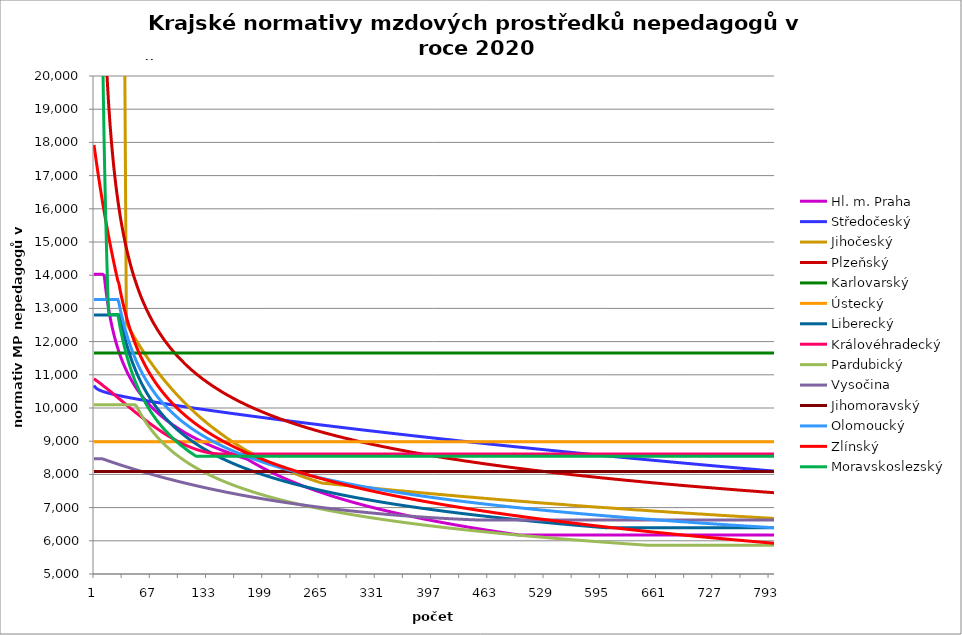
| Category | Hl. m. Praha | Středočeský | Jihočeský | Plzeňský | Karlovarský  | Ústecký   | Liberecký | Královéhradecký | Pardubický | Vysočina | Jihomoravský | Olomoucký | Zlínský | Moravskoslezský |
|---|---|---|---|---|---|---|---|---|---|---|---|---|---|---|
| 0 | 14030.172 | 10682.171 | 71798.217 | 247729.73 | 11657.998 | 8987.069 | 12801.653 | 10883.557 | 10101.406 | 8467.955 | 8087.211 | 13264.813 | 17922.62 | 232200 |
| 1 | 14030.172 | 10636.393 | 71798.217 | 123864.865 | 11657.998 | 8987.069 | 12801.653 | 10865.327 | 10101.406 | 8467.955 | 8087.211 | 13264.813 | 17735.044 | 116100 |
| 2 | 14030.172 | 10608.257 | 71798.217 | 82576.577 | 11657.998 | 8987.069 | 12801.653 | 10842.624 | 10101.406 | 8467.955 | 8087.211 | 13264.813 | 17551.353 | 77400 |
| 3 | 14030.172 | 10587.312 | 71798.217 | 61932.432 | 11657.998 | 8987.069 | 12801.653 | 10824.531 | 10101.406 | 8467.955 | 8087.211 | 13264.813 | 17371.429 | 58050 |
| 4 | 14030.172 | 10570.297 | 71798.217 | 49456.835 | 11657.998 | 8987.069 | 12801.653 | 10806.497 | 10101.406 | 8467.955 | 8087.211 | 13264.813 | 17195.155 | 46440 |
| 5 | 14030.172 | 10555.763 | 71798.217 | 41226.387 | 11657.998 | 8987.069 | 12801.653 | 10788.524 | 10101.406 | 8467.955 | 8087.211 | 13264.813 | 17022.424 | 38700 |
| 6 | 14030.172 | 10542.94 | 71798.217 | 35344.473 | 11657.998 | 8987.069 | 12801.653 | 10766.141 | 10101.406 | 8467.955 | 8087.211 | 13264.813 | 16853.128 | 33171.429 |
| 7 | 14030.172 | 10531.369 | 71798.217 | 30931.384 | 11657.998 | 8987.069 | 12801.653 | 10748.302 | 10101.406 | 8467.955 | 8087.211 | 13264.813 | 16687.166 | 29025 |
| 8 | 14030.172 | 10520.753 | 71798.217 | 27498 | 11657.998 | 8987.069 | 12801.653 | 10730.521 | 10101.406 | 8467.955 | 8087.211 | 13264.813 | 16524.442 | 25800 |
| 9 | 14030.172 | 10510.891 | 71798.217 | 24750.675 | 11657.998 | 8987.069 | 12801.653 | 10708.378 | 10101.406 | 8467.955 | 8087.211 | 13264.813 | 16364.86 | 23220 |
| 10 | 14030.172 | 10501.639 | 30465.73 | 22502.455 | 11657.998 | 8987.069 | 12801.653 | 10686.326 | 10101.406 | 8467.955 | 8087.211 | 13264.813 | 16208.331 | 21109.091 |
| 11 | 14030.172 | 10492.891 | 30465.73 | 22782.104 | 11657.998 | 8987.069 | 12801.653 | 10668.75 | 10101.406 | 8458.902 | 8087.211 | 13264.813 | 16054.768 | 19350 |
| 12 | 13992.888 | 10484.567 | 30465.73 | 21980.815 | 11657.998 | 8987.069 | 12801.653 | 10646.861 | 10101.406 | 8450.127 | 8087.211 | 13264.813 | 15904.087 | 17861.538 |
| 13 | 13757.851 | 10476.603 | 30465.73 | 21283.282 | 11657.998 | 8987.069 | 12801.653 | 10629.414 | 10101.406 | 8441.112 | 8087.211 | 13264.813 | 15756.209 | 16585.714 |
| 14 | 13545.701 | 10468.951 | 30465.73 | 20675.188 | 11657.998 | 8987.069 | 12801.653 | 10607.686 | 10101.406 | 8432.116 | 8087.211 | 13264.813 | 15611.055 | 15480 |
| 15 | 13352.792 | 10461.57 | 30465.73 | 20145.055 | 11657.998 | 8987.069 | 12801.653 | 10586.047 | 10101.406 | 8423.14 | 8087.211 | 13264.813 | 15468.551 | 14512.5 |
| 16 | 13176.251 | 10454.428 | 30465.73 | 19669.528 | 11657.998 | 8987.069 | 12801.653 | 10564.495 | 10101.406 | 8414.439 | 8087.211 | 13264.813 | 15328.626 | 13658.824 |
| 17 | 13013.779 | 10447.497 | 30465.73 | 19229.371 | 11657.998 | 8987.069 | 12801.653 | 10543.031 | 10101.406 | 8405.5 | 8087.211 | 13264.813 | 15191.209 | 12900 |
| 18 | 12863.509 | 10440.756 | 30465.73 | 18847.156 | 11657.998 | 8987.069 | 12801.653 | 10525.923 | 10101.406 | 8396.835 | 8087.211 | 13264.813 | 15056.234 | 12816.692 |
| 19 | 12723.909 | 10434.184 | 30465.73 | 18479.839 | 11657.998 | 8987.069 | 12801.653 | 10504.615 | 10101.406 | 8387.933 | 8087.211 | 13264.813 | 14923.636 | 12816.692 |
| 20 | 12593.707 | 10427.766 | 20874.667 | 18162.483 | 11657.998 | 8987.069 | 12801.653 | 10483.394 | 10101.406 | 8379.304 | 8087.211 | 13264.813 | 14793.354 | 12816.692 |
| 21 | 12471.835 | 10421.487 | 20874.667 | 17855.844 | 11657.998 | 8987.069 | 12801.653 | 10462.258 | 10101.406 | 8370.44 | 8087.211 | 13264.813 | 14665.327 | 12816.692 |
| 22 | 12357.391 | 10415.336 | 20874.667 | 17581.841 | 11657.998 | 8987.069 | 12801.653 | 10441.207 | 10101.406 | 8361.847 | 8087.211 | 13264.813 | 14539.496 | 12816.692 |
| 23 | 12249.606 | 10409.301 | 20874.667 | 17316.121 | 11657.998 | 8987.069 | 12801.653 | 10420.241 | 10101.406 | 8353.271 | 8087.211 | 13264.813 | 14415.807 | 12816.692 |
| 24 | 12147.82 | 10403.374 | 20874.667 | 17079.503 | 11657.998 | 8987.069 | 12801.653 | 10395.192 | 10101.406 | 8344.713 | 8087.211 | 13264.813 | 14294.204 | 12816.692 |
| 25 | 12051.461 | 10397.546 | 20874.667 | 16849.265 | 11657.998 | 8987.069 | 12801.653 | 10374.41 | 10101.406 | 8336.173 | 8087.211 | 13264.813 | 14174.636 | 12816.692 |
| 26 | 11960.033 | 10391.81 | 20874.667 | 16635.209 | 11657.998 | 8987.069 | 12801.653 | 10353.711 | 10101.406 | 8327.65 | 8087.211 | 13264.813 | 14057.051 | 12816.692 |
| 27 | 11873.102 | 10386.159 | 20874.667 | 16436.342 | 11657.998 | 8987.069 | 12801.653 | 10333.094 | 10101.406 | 8319.144 | 8087.211 | 13264.813 | 13941.401 | 12816.692 |
| 28 | 11790.287 | 10380.587 | 20874.667 | 16251.773 | 11657.998 | 8987.069 | 12801.653 | 10312.56 | 10101.406 | 8310.656 | 8087.211 | 13264.813 | 13827.639 | 12816.692 |
| 29 | 11711.251 | 10375.09 | 20874.667 | 16071.303 | 11657.998 | 8987.069 | 12801.653 | 10292.106 | 10101.406 | 8302.434 | 8087.211 | 13194.255 | 13773.695 | 12667.838 |
| 30 | 11635.694 | 10369.663 | 20874.667 | 15903.991 | 11657.998 | 8987.069 | 12801.729 | 10267.669 | 10101.406 | 8293.98 | 8087.211 | 13069.125 | 13637.513 | 12525.737 |
| 31 | 11563.351 | 10364.301 | 20874.667 | 15740.126 | 11657.998 | 8987.069 | 12674.904 | 10247.393 | 10101.406 | 8285.543 | 8087.211 | 12946.347 | 13507.993 | 12391.152 |
| 32 | 11493.983 | 10359 | 20874.667 | 15588.435 | 11657.998 | 8987.069 | 12554.304 | 10227.197 | 10101.406 | 8277.124 | 8087.211 | 12832.488 | 13384.591 | 12263.441 |
| 33 | 11427.377 | 10353.757 | 20874.667 | 15448.315 | 11657.998 | 8987.069 | 12439.426 | 10203.067 | 10101.406 | 8268.968 | 8087.211 | 12727.142 | 13266.824 | 12142.034 |
| 34 | 11363.341 | 10348.57 | 20874.667 | 15310.69 | 11657.998 | 8987.069 | 12329.823 | 10183.046 | 10101.406 | 8260.582 | 8087.211 | 12617.091 | 13154.26 | 12026.425 |
| 35 | 11301.701 | 10343.434 | 20874.667 | 15175.497 | 11657.998 | 8987.069 | 12225.096 | 10163.102 | 10101.406 | 8252.458 | 8087.211 | 12521.555 | 13046.513 | 11916.162 |
| 36 | 11242.299 | 10338.347 | 20874.667 | 15050.903 | 11657.998 | 8987.069 | 12124.887 | 10139.273 | 10101.406 | 8244.106 | 8087.211 | 12421.232 | 12943.237 | 11810.844 |
| 37 | 11184.993 | 10333.307 | 20874.667 | 14928.339 | 11657.998 | 8987.069 | 12028.872 | 10119.501 | 10101.406 | 8236.26 | 8087.211 | 12328.628 | 12844.119 | 11710.106 |
| 38 | 11129.652 | 10328.311 | 12552.227 | 14815.733 | 11657.998 | 8987.069 | 11936.761 | 10095.875 | 10101.406 | 8227.94 | 8087.211 | 12243.435 | 12748.875 | 11613.624 |
| 39 | 11076.156 | 10323.357 | 12505.236 | 14704.813 | 11657.998 | 8987.069 | 11848.29 | 10076.272 | 10101.406 | 8219.881 | 8087.211 | 12159.412 | 12657.249 | 11521.103 |
| 40 | 11024.399 | 10318.444 | 12458.71 | 14595.541 | 11657.998 | 8987.069 | 11763.22 | 10052.848 | 10101.406 | 8211.837 | 8087.211 | 12076.534 | 12569.008 | 11432.276 |
| 41 | 10974.278 | 10313.569 | 12412.64 | 14495.519 | 11657.998 | 8987.069 | 11681.333 | 10033.411 | 10101.406 | 8204.053 | 8087.211 | 11994.778 | 12483.939 | 11346.899 |
| 42 | 10925.703 | 10308.731 | 12367.023 | 14396.859 | 11657.998 | 8987.069 | 11602.43 | 10010.185 | 10101.406 | 8196.04 | 8087.211 | 11919.846 | 12401.848 | 11264.754 |
| 43 | 10878.588 | 10303.928 | 12321.85 | 14299.532 | 11657.998 | 8987.069 | 11526.33 | 9990.913 | 10101.406 | 8188.043 | 8087.211 | 11845.845 | 12322.558 | 11185.638 |
| 44 | 10832.856 | 10299.159 | 12277.116 | 14203.512 | 11657.998 | 8987.069 | 11452.867 | 9967.883 | 10101.406 | 8180.062 | 8087.211 | 11772.757 | 12245.904 | 11109.366 |
| 45 | 10788.434 | 10294.422 | 12232.815 | 14116.016 | 11657.998 | 8987.069 | 11381.886 | 9948.773 | 10101.406 | 8172.096 | 8087.211 | 11706.088 | 12171.738 | 11035.771 |
| 46 | 10745.255 | 10289.716 | 12188.942 | 14029.592 | 11657.998 | 8987.069 | 11313.248 | 9925.937 | 10101.406 | 8164.387 | 8087.211 | 11640.169 | 12099.92 | 10964.696 |
| 47 | 10703.256 | 10285.04 | 12145.489 | 13944.219 | 11657.998 | 8987.069 | 11246.822 | 9906.987 | 10101.406 | 8156.452 | 8087.211 | 11574.988 | 12030.323 | 10895.998 |
| 48 | 10662.381 | 10280.393 | 12102.453 | 13866.868 | 11657.998 | 8987.069 | 11182.49 | 9884.343 | 10101.406 | 8148.532 | 8087.211 | 11515.877 | 11962.829 | 10829.547 |
| 49 | 10622.575 | 10275.773 | 12059.827 | 13790.371 | 11657.998 | 8987.069 | 11120.139 | 9865.551 | 10101.406 | 8140.627 | 8087.211 | 11452.078 | 11897.328 | 10765.219 |
| 50 | 10583.788 | 10271.18 | 12017.605 | 13714.713 | 11657.998 | 8987.069 | 11059.667 | 9843.096 | 10050.07 | 8133.216 | 8087.211 | 11394.212 | 11833.719 | 10702.903 |
| 51 | 10545.973 | 10266.613 | 11975.783 | 13639.881 | 11657.998 | 8987.069 | 11000.978 | 9824.46 | 9999.816 | 8125.341 | 8087.211 | 11336.929 | 11771.907 | 10642.494 |
| 52 | 10509.086 | 10262.071 | 11934.355 | 13565.861 | 11657.998 | 8987.069 | 10943.984 | 9802.191 | 9950.984 | 8117.482 | 8087.211 | 11280.218 | 11711.805 | 10583.894 |
| 53 | 10473.085 | 10257.553 | 11893.317 | 13499.264 | 11657.998 | 8987.069 | 10888.602 | 9783.71 | 9903.505 | 8110.112 | 8087.211 | 11229.153 | 11653.33 | 10527.013 |
| 54 | 10437.934 | 10253.058 | 11852.662 | 13426.758 | 11657.998 | 8987.069 | 10834.754 | 9761.625 | 9857.315 | 8102.519 | 8087.211 | 11173.514 | 11596.407 | 10471.768 |
| 55 | 10403.595 | 10248.585 | 11812.386 | 13361.516 | 11657.998 | 8987.069 | 10782.37 | 9743.297 | 9812.354 | 8094.704 | 8087.211 | 11123.408 | 11540.963 | 10418.08 |
| 56 | 10370.034 | 10244.135 | 11772.484 | 13296.905 | 11657.998 | 8987.069 | 10731.38 | 9721.394 | 9768.568 | 8087.139 | 8087.211 | 11073.75 | 11486.932 | 10365.875 |
| 57 | 10337.219 | 10239.705 | 11732.952 | 13239.287 | 11657.998 | 8987.069 | 10681.723 | 9703.216 | 9725.903 | 8079.825 | 8087.211 | 11024.533 | 11434.251 | 10315.085 |
| 58 | 10305.121 | 10235.296 | 11693.784 | 13175.851 | 11657.998 | 8987.069 | 10633.34 | 9681.493 | 9684.311 | 8072.053 | 8087.211 | 10980.611 | 11382.861 | 10265.646 |
| 59 | 10273.71 | 10230.906 | 11654.976 | 13119.275 | 11657.998 | 8987.069 | 10586.173 | 9663.464 | 9643.744 | 8064.531 | 8087.211 | 10932.217 | 11332.707 | 10217.498 |
| 60 | 10242.961 | 10226.536 | 11616.524 | 13063.183 | 11657.998 | 8987.069 | 10540.173 | 9641.918 | 9604.161 | 8057.258 | 8087.211 | 10889.025 | 11283.738 | 10170.585 |
| 61 | 10212.847 | 10222.185 | 11578.422 | 13001.418 | 11657.998 | 8987.069 | 10495.289 | 9624.036 | 9565.521 | 8049.763 | 8087.211 | 10846.174 | 11235.903 | 10124.853 |
| 62 | 10183.345 | 10217.852 | 11540.667 | 12946.328 | 11657.998 | 8987.069 | 10451.475 | 9602.665 | 9527.784 | 8042.516 | 8087.211 | 10803.659 | 11189.158 | 10080.252 |
| 63 | 10154.432 | 10213.536 | 11503.254 | 12897.749 | 11657.998 | 8987.069 | 10408.688 | 9584.928 | 9490.914 | 8035.049 | 8087.211 | 10761.475 | 11143.458 | 10036.735 |
| 64 | 10126.086 | 10209.238 | 11466.179 | 12843.531 | 11657.998 | 8987.069 | 10366.886 | 9563.73 | 9454.878 | 8027.596 | 8087.211 | 10719.62 | 11098.762 | 9994.259 |
| 65 | 10098.288 | 10204.956 | 11429.437 | 12789.767 | 11657.998 | 8987.069 | 10326.032 | 9546.137 | 9419.643 | 8020.621 | 8087.211 | 10678.089 | 11055.032 | 9952.781 |
| 66 | 10071.017 | 10200.691 | 11393.025 | 12742.354 | 11657.998 | 8987.069 | 10286.088 | 9525.11 | 9385.179 | 8013.194 | 8087.211 | 10641.441 | 11012.231 | 9912.262 |
| 67 | 10044.256 | 10196.442 | 11356.939 | 12695.291 | 11657.998 | 8987.069 | 10247.019 | 9507.658 | 9351.455 | 8005.782 | 8087.211 | 10600.513 | 10970.324 | 9872.665 |
| 68 | 10017.986 | 10192.208 | 11321.174 | 12642.759 | 11657.998 | 8987.069 | 10208.793 | 9486.801 | 9318.446 | 7998.614 | 8087.211 | 10564.395 | 10929.279 | 9833.954 |
| 69 | 9992.192 | 10187.99 | 11285.727 | 12596.427 | 11657.998 | 8987.069 | 10171.378 | 9469.489 | 9286.124 | 7991.458 | 8087.211 | 10528.523 | 10889.063 | 9796.096 |
| 70 | 9966.858 | 10183.786 | 11250.594 | 12550.434 | 11657.998 | 8987.069 | 10134.746 | 9452.24 | 9254.466 | 7984.316 | 8087.211 | 10492.893 | 10849.647 | 9759.06 |
| 71 | 9941.968 | 10179.597 | 11215.771 | 12504.775 | 11657.998 | 8987.069 | 10098.867 | 9431.625 | 9223.448 | 7977.186 | 8087.211 | 10457.504 | 10811.003 | 9722.814 |
| 72 | 9917.508 | 10175.421 | 11181.254 | 12465.095 | 11657.998 | 8987.069 | 10063.716 | 9414.514 | 9193.046 | 7970.299 | 8087.211 | 10422.353 | 10773.105 | 9687.331 |
| 73 | 9893.464 | 10171.26 | 11147.04 | 12420.054 | 11657.998 | 8987.069 | 10029.266 | 9397.465 | 9163.241 | 7962.965 | 8087.211 | 10387.437 | 10735.927 | 9652.584 |
| 74 | 9869.824 | 10167.112 | 11113.124 | 12375.338 | 11657.998 | 8987.069 | 9995.494 | 9377.087 | 9134.012 | 7955.873 | 8087.211 | 10357.077 | 10699.444 | 9618.546 |
| 75 | 9846.574 | 10162.977 | 11079.505 | 12336.474 | 11657.998 | 8987.069 | 9962.378 | 9360.173 | 9105.34 | 7949.023 | 8087.211 | 10322.597 | 10663.633 | 9585.194 |
| 76 | 9823.703 | 10158.855 | 11046.177 | 12297.853 | 11657.998 | 8987.069 | 9929.894 | 9343.32 | 9077.206 | 7941.728 | 8087.211 | 10292.614 | 10628.473 | 9552.504 |
| 77 | 9801.199 | 10154.746 | 11013.138 | 12254.011 | 11657.998 | 8987.069 | 9898.022 | 9326.528 | 9049.592 | 7934.902 | 8087.211 | 10258.561 | 10593.942 | 9520.454 |
| 78 | 9779.052 | 10150.649 | 10980.384 | 12215.904 | 11657.998 | 8987.069 | 9866.743 | 9309.795 | 9022.483 | 7927.86 | 8087.211 | 10228.948 | 10560.02 | 9489.022 |
| 79 | 9757.251 | 10146.565 | 10947.911 | 12178.034 | 11657.998 | 8987.069 | 9836.037 | 9289.796 | 8995.862 | 7921.057 | 8087.211 | 10199.507 | 10526.688 | 9458.189 |
| 80 | 9735.785 | 10142.492 | 10915.718 | 12140.397 | 11657.998 | 8987.069 | 9805.886 | 9273.195 | 8969.714 | 7914.04 | 8087.211 | 10170.234 | 10493.928 | 9427.934 |
| 81 | 9714.646 | 10138.43 | 10883.8 | 12102.993 | 11657.998 | 8987.069 | 9776.273 | 9256.654 | 8944.024 | 7907.261 | 8087.211 | 10141.128 | 10461.722 | 9398.24 |
| 82 | 9693.824 | 10134.381 | 10852.154 | 12065.818 | 11657.998 | 8987.069 | 9747.182 | 9240.171 | 8918.779 | 7900.494 | 8087.211 | 10112.189 | 10430.054 | 9369.09 |
| 83 | 9673.31 | 10130.342 | 10820.777 | 12028.871 | 11657.998 | 8987.069 | 9718.595 | 9223.747 | 8893.964 | 7893.738 | 8087.211 | 10083.415 | 10398.906 | 9340.465 |
| 84 | 9653.096 | 10126.314 | 10789.666 | 11997.382 | 11657.998 | 8987.069 | 9690.499 | 9207.381 | 8869.568 | 7886.769 | 8087.211 | 10054.803 | 10368.265 | 9312.351 |
| 85 | 9633.173 | 10122.297 | 10758.818 | 11960.853 | 11657.998 | 8987.069 | 9662.878 | 9191.073 | 8845.578 | 7880.261 | 8087.211 | 10030.408 | 10338.115 | 9284.731 |
| 86 | 9613.534 | 10118.291 | 10728.23 | 11929.718 | 11657.998 | 8987.069 | 9635.719 | 9174.823 | 8821.982 | 7873.316 | 8087.211 | 10002.097 | 10308.442 | 9257.591 |
| 87 | 9594.171 | 10114.295 | 10697.899 | 11893.599 | 11657.998 | 8987.069 | 9609.009 | 9158.63 | 8798.768 | 7866.606 | 8087.211 | 9973.945 | 10279.233 | 9230.917 |
| 88 | 9575.076 | 10110.309 | 10667.823 | 11862.813 | 11657.998 | 8987.069 | 9582.733 | 9145.717 | 8775.927 | 7860.131 | 8087.211 | 9949.94 | 10250.474 | 9204.694 |
| 89 | 9556.244 | 10106.333 | 10637.997 | 11827.097 | 11657.998 | 8987.069 | 9556.881 | 9129.627 | 8753.447 | 7853.444 | 8087.211 | 9926.05 | 10222.153 | 9178.911 |
| 90 | 9537.666 | 10102.368 | 10608.421 | 11796.654 | 11657.998 | 8987.069 | 9531.44 | 9113.593 | 8731.319 | 7846.768 | 8087.211 | 9898.324 | 10194.258 | 9153.555 |
| 91 | 9519.337 | 10098.411 | 10579.09 | 11766.367 | 11657.998 | 8987.069 | 9506.4 | 9097.616 | 8709.533 | 7840.104 | 8087.211 | 9874.682 | 10166.778 | 9128.613 |
| 92 | 9501.251 | 10094.465 | 10550.002 | 11736.236 | 11657.998 | 8987.069 | 9481.748 | 9084.874 | 8688.08 | 7833.673 | 8087.211 | 9851.152 | 10139.701 | 9104.074 |
| 93 | 9483.401 | 10090.527 | 10521.155 | 11706.258 | 11657.998 | 8987.069 | 9457.474 | 9068.997 | 8666.951 | 7826.809 | 8087.211 | 9827.734 | 10113.016 | 9079.927 |
| 94 | 9465.781 | 10086.599 | 10492.545 | 11676.433 | 11657.998 | 8987.069 | 9433.57 | 9056.335 | 8646.137 | 7820.4 | 8087.211 | 9804.427 | 10086.714 | 9056.161 |
| 95 | 9448.386 | 10082.68 | 10464.171 | 11646.76 | 11657.998 | 8987.069 | 9410.023 | 9040.557 | 8625.631 | 7814.001 | 8087.211 | 9781.23 | 10060.784 | 9032.766 |
| 96 | 9431.211 | 10078.77 | 10436.03 | 11617.237 | 11657.998 | 8987.069 | 9386.826 | 9027.975 | 8605.423 | 7807.392 | 8087.211 | 9758.143 | 10035.217 | 9009.732 |
| 97 | 9414.25 | 10074.869 | 10408.118 | 11587.863 | 11657.998 | 8987.069 | 9363.969 | 9012.296 | 8585.507 | 7801.014 | 8087.211 | 9735.165 | 10010.003 | 8987.05 |
| 98 | 9397.498 | 10070.976 | 10380.434 | 11558.638 | 11657.998 | 8987.069 | 9341.444 | 8999.792 | 8565.876 | 7794.647 | 8087.211 | 9712.294 | 9985.134 | 8964.711 |
| 99 | 9380.95 | 10067.092 | 10352.976 | 11529.56 | 11657.998 | 8987.069 | 9319.242 | 8987.322 | 8546.521 | 7788.071 | 8087.211 | 9689.531 | 9960.602 | 8942.705 |
| 100 | 9364.603 | 10063.216 | 10325.74 | 11505.439 | 11657.998 | 8987.069 | 9297.355 | 8971.784 | 8527.436 | 7781.943 | 8087.211 | 9666.875 | 9936.397 | 8921.024 |
| 101 | 9348.45 | 10059.349 | 10298.725 | 11476.628 | 11657.998 | 8987.069 | 9275.775 | 8959.392 | 8508.615 | 7775.606 | 8087.211 | 9648.075 | 9912.513 | 8899.66 |
| 102 | 9332.488 | 10055.489 | 10271.928 | 11452.728 | 11657.998 | 8987.069 | 9254.495 | 8947.034 | 8490.052 | 7769.062 | 8087.211 | 9625.611 | 9888.94 | 8878.605 |
| 103 | 9316.712 | 10051.638 | 10245.346 | 11424.179 | 11657.998 | 8987.069 | 9233.508 | 8934.711 | 8471.739 | 7762.965 | 8087.211 | 9603.252 | 9865.673 | 8857.852 |
| 104 | 9301.118 | 10047.795 | 10218.978 | 11400.498 | 11657.998 | 8987.069 | 9212.806 | 8922.421 | 8453.671 | 7756.659 | 8087.211 | 9584.699 | 9842.703 | 8837.393 |
| 105 | 9285.703 | 10043.959 | 10192.822 | 11372.208 | 11657.998 | 8987.069 | 9192.382 | 8910.165 | 8435.843 | 7750.364 | 8087.211 | 9562.529 | 9820.024 | 8817.22 |
| 106 | 9270.462 | 10040.132 | 10166.875 | 11348.741 | 11657.998 | 8987.069 | 9172.231 | 8897.942 | 8418.248 | 7744.079 | 8087.211 | 9544.132 | 9797.628 | 8797.327 |
| 107 | 9255.392 | 10036.311 | 10141.134 | 11320.708 | 11657.998 | 8987.069 | 9152.345 | 8885.753 | 8400.882 | 7738.02 | 8087.211 | 9525.806 | 9775.511 | 8777.708 |
| 108 | 9240.489 | 10032.499 | 10115.598 | 11297.453 | 11657.998 | 8987.069 | 9132.719 | 8873.598 | 8383.739 | 7731.539 | 8087.211 | 9503.908 | 9753.664 | 8758.356 |
| 109 | 9225.749 | 10028.693 | 10090.266 | 11274.293 | 11657.998 | 8987.069 | 9113.346 | 8861.475 | 8366.814 | 7725.5 | 8087.211 | 9485.736 | 9732.083 | 8739.265 |
| 110 | 9211.169 | 10024.896 | 10065.133 | 11251.227 | 11657.998 | 8987.069 | 9094.222 | 8852.405 | 8350.102 | 7719.47 | 8087.211 | 9467.634 | 9710.761 | 8720.428 |
| 111 | 9196.746 | 10021.105 | 10040.2 | 11228.256 | 11657.998 | 8987.069 | 9075.339 | 8840.341 | 8333.598 | 7713.45 | 8087.211 | 9449.6 | 9689.692 | 8701.84 |
| 112 | 9182.477 | 10017.321 | 10015.462 | 11205.379 | 11657.998 | 8987.069 | 9056.694 | 8831.314 | 8317.298 | 7707.225 | 8087.211 | 9431.635 | 9668.872 | 8683.495 |
| 113 | 9168.358 | 10013.545 | 9990.92 | 11182.595 | 11657.998 | 8987.069 | 9038.28 | 8819.307 | 8301.198 | 7701.224 | 8087.211 | 9410.167 | 9648.294 | 8665.388 |
| 114 | 9154.386 | 10009.775 | 9966.57 | 11155.375 | 11657.998 | 8987.069 | 9020.093 | 8810.323 | 8285.293 | 7695.232 | 8087.211 | 9392.351 | 9627.953 | 8647.514 |
| 115 | 9140.559 | 10006.013 | 9942.41 | 11137.303 | 11657.998 | 8987.069 | 9002.128 | 8798.372 | 8269.579 | 7689.249 | 8087.211 | 9374.603 | 9607.845 | 8629.867 |
| 116 | 9126.873 | 10002.257 | 9918.44 | 11114.794 | 11657.998 | 8987.069 | 8984.38 | 8789.431 | 8254.051 | 7683.063 | 8087.211 | 9356.922 | 9587.964 | 8612.443 |
| 117 | 9113.326 | 9998.507 | 9894.656 | 11092.376 | 11657.998 | 8987.069 | 8966.844 | 8780.508 | 8238.707 | 7677.099 | 8087.211 | 9339.307 | 9568.307 | 8595.236 |
| 118 | 9099.915 | 9994.765 | 9871.057 | 11070.048 | 11657.998 | 8987.069 | 8949.516 | 8771.602 | 8223.541 | 7671.145 | 8087.211 | 9325.263 | 9548.867 | 8578.242 |
| 119 | 9086.638 | 9991.029 | 9847.642 | 11047.81 | 11657.998 | 8987.069 | 8932.392 | 8762.715 | 8208.552 | 7665.412 | 8087.211 | 9307.767 | 9529.641 | 8561.456 |
| 120 | 9073.491 | 9987.299 | 9824.408 | 11025.662 | 11657.998 | 8987.069 | 8915.467 | 8753.846 | 8193.733 | 7659.264 | 8087.211 | 9290.337 | 9510.625 | 8545.876 |
| 121 | 9060.473 | 9983.576 | 9801.353 | 11008.006 | 11657.998 | 8987.069 | 8898.737 | 8744.995 | 8179.084 | 7653.337 | 8087.211 | 9272.972 | 9491.813 | 8545.876 |
| 122 | 9047.581 | 9979.86 | 9778.477 | 10986.017 | 11657.998 | 8987.069 | 8882.199 | 8736.162 | 8164.599 | 7647.631 | 8087.211 | 9255.672 | 9473.203 | 8545.876 |
| 123 | 9034.812 | 9976.149 | 9755.776 | 10964.115 | 11657.998 | 8987.069 | 8865.848 | 8727.346 | 8150.276 | 7641.722 | 8087.211 | 9241.878 | 9454.79 | 8545.876 |
| 124 | 9022.165 | 9972.445 | 9733.25 | 10946.656 | 11657.998 | 8987.069 | 8849.68 | 8721.479 | 8136.111 | 7636.033 | 8087.211 | 9224.693 | 9436.57 | 8545.876 |
| 125 | 9009.637 | 9968.747 | 9710.896 | 10924.911 | 11657.998 | 8987.069 | 8833.693 | 8712.693 | 8122.102 | 7630.352 | 8087.211 | 9207.572 | 9418.54 | 8545.876 |
| 126 | 8997.226 | 9965.055 | 9688.714 | 10903.251 | 11657.998 | 8987.069 | 8817.883 | 8706.846 | 8108.245 | 7624.26 | 8087.211 | 9193.921 | 9400.696 | 8545.876 |
| 127 | 8984.93 | 9961.369 | 9666.701 | 10885.986 | 11657.998 | 8987.069 | 8802.245 | 8698.089 | 8094.538 | 7618.597 | 8087.211 | 9176.915 | 9383.034 | 8545.876 |
| 128 | 8972.747 | 9957.689 | 9644.856 | 10864.48 | 11657.998 | 8987.069 | 8786.777 | 8692.261 | 8080.977 | 7612.942 | 8087.211 | 9163.354 | 9365.55 | 8545.876 |
| 129 | 8960.675 | 9954.015 | 9623.177 | 10847.337 | 11657.998 | 8987.069 | 8771.476 | 8686.441 | 8067.56 | 7607.296 | 8087.211 | 9146.46 | 9348.243 | 8545.876 |
| 130 | 8948.711 | 9950.346 | 9601.663 | 10830.248 | 11657.998 | 8987.069 | 8756.338 | 8680.629 | 8054.283 | 7601.658 | 8087.211 | 9132.99 | 9331.107 | 8545.876 |
| 131 | 8936.855 | 9946.684 | 9580.311 | 10808.962 | 11657.998 | 8987.069 | 8741.36 | 8671.925 | 8041.146 | 7596.028 | 8087.211 | 9116.207 | 9314.141 | 8545.876 |
| 132 | 8925.103 | 9943.027 | 9559.122 | 10791.994 | 11657.998 | 8987.069 | 8726.539 | 8666.132 | 8028.144 | 7590.407 | 8087.211 | 9102.826 | 9297.34 | 8545.876 |
| 133 | 8913.455 | 9939.376 | 9538.092 | 10770.858 | 11657.998 | 8987.069 | 8711.873 | 8663.239 | 8015.275 | 7584.586 | 8087.211 | 9086.154 | 9280.703 | 8545.876 |
| 134 | 8901.909 | 9935.731 | 9517.221 | 10754.009 | 11657.998 | 8987.069 | 8697.358 | 8657.457 | 8002.538 | 7578.982 | 8087.211 | 9072.86 | 9264.225 | 8545.876 |
| 135 | 8890.462 | 9932.091 | 9496.507 | 10737.212 | 11657.998 | 8987.069 | 8682.991 | 8651.684 | 7989.928 | 7573.386 | 8087.211 | 9059.606 | 9247.904 | 8545.876 |
| 136 | 8879.113 | 9928.456 | 9475.948 | 10720.468 | 11657.998 | 8987.069 | 8668.771 | 8645.918 | 7977.446 | 7568.005 | 8087.211 | 9043.092 | 9231.738 | 8545.876 |
| 137 | 8867.861 | 9924.827 | 9455.544 | 10699.611 | 11657.998 | 8987.069 | 8654.694 | 8643.038 | 7965.087 | 7562.425 | 8087.211 | 9029.924 | 9215.724 | 8545.876 |
| 138 | 8856.704 | 9921.204 | 9435.292 | 10682.984 | 11657.998 | 8987.069 | 8640.758 | 8640.16 | 7952.85 | 7556.853 | 8087.211 | 9016.794 | 9199.858 | 8545.876 |
| 139 | 8845.64 | 9917.585 | 9415.192 | 10666.408 | 11657.998 | 8987.069 | 8626.96 | 8634.409 | 7940.732 | 7551.496 | 8087.211 | 9003.702 | 9184.139 | 8545.876 |
| 140 | 8834.668 | 9913.973 | 9395.242 | 10649.884 | 11657.998 | 8987.069 | 8613.298 | 8631.537 | 7928.732 | 7545.94 | 8087.211 | 8990.649 | 9168.563 | 8545.876 |
| 141 | 8823.786 | 9910.365 | 9375.44 | 10633.411 | 11657.998 | 8987.069 | 8599.77 | 8628.666 | 7916.848 | 7540.598 | 8087.211 | 8974.385 | 9153.129 | 8545.876 |
| 142 | 8812.994 | 9906.763 | 9355.786 | 10616.988 | 11657.998 | 8987.069 | 8586.373 | 8625.798 | 7905.077 | 7535.263 | 8087.211 | 8961.416 | 9137.834 | 8545.876 |
| 143 | 8802.288 | 9903.165 | 9336.278 | 10600.617 | 11657.998 | 8987.069 | 8573.104 | 8622.931 | 7893.418 | 7529.732 | 8087.211 | 8948.485 | 9122.676 | 8545.876 |
| 144 | 8791.669 | 9899.573 | 9316.914 | 10584.296 | 11657.998 | 8987.069 | 8559.962 | 8620.066 | 7881.868 | 7524.412 | 8087.211 | 8935.591 | 9107.652 | 8545.876 |
| 145 | 8781.135 | 9895.986 | 9297.694 | 10568.025 | 11657.998 | 8987.069 | 8546.945 | 8617.204 | 7870.427 | 7519.101 | 8087.211 | 8922.734 | 9092.76 | 8545.876 |
| 146 | 8770.684 | 9892.404 | 9278.615 | 10551.804 | 11657.998 | 8987.069 | 8534.05 | 8617.204 | 7859.091 | 7513.797 | 8087.211 | 8909.914 | 9077.998 | 8545.876 |
| 147 | 8760.315 | 9888.827 | 9259.678 | 10535.632 | 11657.998 | 8987.069 | 8521.276 | 8617.204 | 7847.86 | 7508.5 | 8087.211 | 8897.131 | 9063.364 | 8545.876 |
| 148 | 8750.027 | 9885.255 | 9240.88 | 10519.51 | 11657.998 | 8987.069 | 8508.62 | 8617.204 | 7836.731 | 7503.211 | 8087.211 | 8884.384 | 9048.856 | 8545.876 |
| 149 | 8739.819 | 9881.688 | 9222.22 | 10503.438 | 11657.998 | 8987.069 | 8496.081 | 8617.204 | 7825.703 | 7497.929 | 8087.211 | 8871.674 | 9034.471 | 8545.876 |
| 150 | 8729.689 | 9878.126 | 9203.698 | 10487.414 | 11657.998 | 8987.069 | 8483.656 | 8617.204 | 7814.775 | 7492.654 | 8087.211 | 8859 | 9020.208 | 8545.876 |
| 151 | 8719.636 | 9874.569 | 9185.311 | 10471.439 | 11657.998 | 8987.069 | 8471.343 | 8617.204 | 7803.944 | 7487.387 | 8087.211 | 8846.362 | 9006.065 | 8545.876 |
| 152 | 8709.66 | 9871.016 | 9167.06 | 10455.513 | 11657.998 | 8987.069 | 8459.142 | 8617.204 | 7793.209 | 7482.128 | 8087.211 | 8836.908 | 8992.039 | 8545.876 |
| 153 | 8699.758 | 9867.469 | 9148.941 | 10443.6 | 11657.998 | 8987.069 | 8447.05 | 8617.204 | 7782.569 | 7476.876 | 8087.211 | 8824.333 | 8978.13 | 8545.876 |
| 154 | 8689.93 | 9863.926 | 9130.956 | 10427.759 | 11657.998 | 8987.069 | 8435.064 | 8617.204 | 7772.022 | 7471.833 | 8087.211 | 8811.794 | 8964.335 | 8545.876 |
| 155 | 8680.175 | 9860.387 | 9113.101 | 10411.965 | 11657.998 | 8987.069 | 8423.185 | 8617.204 | 7761.567 | 7466.595 | 8087.211 | 8799.291 | 8950.653 | 8545.876 |
| 156 | 8670.492 | 9856.854 | 9095.377 | 10396.219 | 11657.998 | 8987.069 | 8411.41 | 8617.204 | 7751.202 | 7461.364 | 8087.211 | 8786.823 | 8937.081 | 8545.876 |
| 157 | 8660.879 | 9853.325 | 9077.782 | 10384.441 | 11657.998 | 8987.069 | 8399.737 | 8617.204 | 7740.925 | 7456.342 | 8087.211 | 8777.495 | 8923.618 | 8545.876 |
| 158 | 8651.336 | 9849.8 | 9060.314 | 10368.778 | 11657.998 | 8987.069 | 8388.164 | 8617.204 | 7730.736 | 7451.326 | 8087.211 | 8765.088 | 8910.263 | 8545.876 |
| 159 | 8641.862 | 9846.281 | 9042.974 | 10353.163 | 11657.998 | 8987.069 | 8376.691 | 8617.204 | 7720.634 | 7446.117 | 8087.211 | 8752.717 | 8897.013 | 8545.876 |
| 160 | 8632.455 | 9842.765 | 9025.759 | 10341.482 | 11657.998 | 8987.069 | 8365.316 | 8617.204 | 7710.615 | 7441.116 | 8087.211 | 8743.461 | 8883.868 | 8545.876 |
| 161 | 8623.115 | 9839.255 | 9008.669 | 10325.948 | 11657.998 | 8987.069 | 8354.036 | 8617.204 | 7700.681 | 7436.32 | 8087.211 | 8731.151 | 8870.825 | 8545.876 |
| 162 | 8613.841 | 9835.748 | 8991.703 | 10310.461 | 11657.998 | 8987.069 | 8342.852 | 8617.204 | 7690.829 | 7431.132 | 8087.211 | 8718.875 | 8857.884 | 8545.876 |
| 163 | 8604.631 | 9832.246 | 8974.859 | 10298.876 | 11657.998 | 8987.069 | 8331.761 | 8617.204 | 7681.057 | 7426.15 | 8087.211 | 8709.691 | 8845.042 | 8545.876 |
| 164 | 8595.486 | 9828.749 | 8958.137 | 10283.47 | 11657.998 | 8987.069 | 8320.761 | 8617.204 | 7671.366 | 7421.175 | 8087.211 | 8697.475 | 8832.298 | 8545.876 |
| 165 | 8586.404 | 9825.256 | 8941.536 | 10271.946 | 11657.998 | 8987.069 | 8309.852 | 8617.204 | 7661.753 | 7416.207 | 8087.211 | 8685.294 | 8819.651 | 8545.876 |
| 166 | 8577.384 | 9821.767 | 8925.055 | 10256.621 | 11657.998 | 8987.069 | 8299.033 | 8617.204 | 7652.218 | 7411.245 | 8087.211 | 8676.18 | 8807.1 | 8545.876 |
| 167 | 8568.425 | 9818.283 | 8908.692 | 10245.156 | 11657.998 | 8987.069 | 8288.301 | 8617.204 | 7642.759 | 7406.29 | 8087.211 | 8664.059 | 8794.642 | 8545.876 |
| 168 | 8559.527 | 9814.803 | 8892.446 | 10229.911 | 11657.998 | 8987.069 | 8277.656 | 8617.204 | 7633.376 | 7401.342 | 8087.211 | 8654.99 | 8782.277 | 8545.876 |
| 169 | 8550.689 | 9811.327 | 8876.318 | 10218.506 | 11657.998 | 8987.069 | 8267.097 | 8617.204 | 7624.067 | 7396.597 | 8087.211 | 8642.927 | 8770.004 | 8545.876 |
| 170 | 8541.91 | 9807.855 | 8860.305 | 10203.34 | 11657.998 | 8987.069 | 8256.621 | 8617.204 | 7614.83 | 7391.859 | 8087.211 | 8633.902 | 8757.82 | 8545.876 |
| 171 | 8533.188 | 9804.388 | 8844.407 | 10191.994 | 11657.998 | 8987.069 | 8246.229 | 8617.204 | 7605.666 | 7386.93 | 8087.211 | 8621.898 | 8745.726 | 8545.876 |
| 172 | 8524.525 | 9800.925 | 8828.623 | 10176.906 | 11657.998 | 8987.069 | 8235.918 | 8617.204 | 7596.574 | 7382.007 | 8087.211 | 8612.917 | 8733.719 | 8545.876 |
| 173 | 8515.917 | 9797.466 | 8812.952 | 10165.619 | 11657.998 | 8987.069 | 8225.688 | 8617.204 | 7587.551 | 7377.288 | 8087.211 | 8603.954 | 8721.798 | 8545.876 |
| 174 | 8507.366 | 9794.011 | 8797.393 | 10154.357 | 11657.998 | 8987.069 | 8215.537 | 8617.204 | 7578.597 | 7372.574 | 8087.211 | 8592.033 | 8709.963 | 8545.876 |
| 175 | 8498.87 | 9790.56 | 8781.946 | 10139.381 | 11657.998 | 8987.069 | 8205.465 | 8617.204 | 7569.712 | 7367.867 | 8087.211 | 8583.114 | 8698.211 | 8545.876 |
| 176 | 8490.429 | 9787.113 | 8766.608 | 10128.177 | 11657.998 | 8987.069 | 8195.47 | 8617.204 | 7560.893 | 7362.969 | 8087.211 | 8571.251 | 8686.543 | 8545.876 |
| 177 | 8482.041 | 9783.67 | 8751.381 | 10116.998 | 11657.998 | 8987.069 | 8185.552 | 8617.204 | 7552.141 | 7358.274 | 8087.211 | 8562.375 | 8674.956 | 8545.876 |
| 178 | 8473.707 | 9780.232 | 8736.261 | 10102.131 | 11657.998 | 8987.069 | 8175.708 | 8617.204 | 7543.455 | 7353.585 | 8087.211 | 8553.517 | 8663.45 | 8545.876 |
| 179 | 8465.424 | 9776.797 | 8721.25 | 10091.009 | 11657.998 | 8987.069 | 8165.939 | 8617.204 | 7534.833 | 7348.901 | 8087.211 | 8541.736 | 8652.024 | 8545.876 |
| 180 | 8456.47 | 9773.367 | 8706.345 | 10079.912 | 11657.998 | 8987.069 | 8156.242 | 8617.204 | 7526.275 | 7344.224 | 8087.211 | 8532.921 | 8640.676 | 8545.876 |
| 181 | 8440.899 | 9769.94 | 8691.547 | 10068.839 | 11657.998 | 8987.069 | 8146.618 | 8617.204 | 7517.779 | 7339.553 | 8087.211 | 8524.124 | 8629.406 | 8545.876 |
| 182 | 8425.46 | 9766.517 | 8676.853 | 10054.113 | 11657.998 | 8987.069 | 8137.065 | 8617.204 | 7509.346 | 7334.887 | 8087.211 | 8512.423 | 8618.212 | 8545.876 |
| 183 | 8410.151 | 9763.098 | 8662.265 | 10043.097 | 11657.998 | 8987.069 | 8127.583 | 8617.204 | 7500.973 | 7330.422 | 8087.211 | 8503.668 | 8607.094 | 8545.876 |
| 184 | 8394.971 | 9759.683 | 8647.779 | 10032.105 | 11657.998 | 8987.069 | 8118.169 | 8617.204 | 7492.661 | 7325.768 | 8087.211 | 8494.932 | 8596.05 | 8545.876 |
| 185 | 8379.917 | 9756.272 | 8633.397 | 10021.137 | 11657.998 | 8987.069 | 8108.824 | 8617.204 | 7484.409 | 7321.12 | 8087.211 | 8486.213 | 8585.08 | 8545.876 |
| 186 | 8364.987 | 9752.865 | 8619.117 | 10010.193 | 11657.998 | 8987.069 | 8099.547 | 8617.204 | 7476.215 | 7316.671 | 8087.211 | 8477.512 | 8574.183 | 8545.876 |
| 187 | 8350.18 | 9749.462 | 8604.938 | 9995.638 | 11657.998 | 8987.069 | 8090.336 | 8617.204 | 7468.08 | 7312.228 | 8087.211 | 8465.939 | 8563.357 | 8545.876 |
| 188 | 8335.495 | 9746.062 | 8590.859 | 9984.749 | 11657.998 | 8987.069 | 8081.191 | 8617.204 | 7460.001 | 7307.597 | 8087.211 | 8457.279 | 8552.602 | 8545.876 |
| 189 | 8320.928 | 9742.666 | 8576.881 | 9973.885 | 11657.998 | 8987.069 | 8072.111 | 8617.204 | 7451.98 | 7302.972 | 8087.211 | 8448.638 | 8541.918 | 8545.876 |
| 190 | 8306.479 | 9739.274 | 8563.001 | 9963.043 | 11657.998 | 8987.069 | 8063.095 | 8617.204 | 7444.014 | 7298.738 | 8087.211 | 8440.014 | 8531.302 | 8545.876 |
| 191 | 8292.146 | 9735.886 | 8549.22 | 9952.226 | 11657.998 | 8987.069 | 8054.142 | 8617.204 | 7436.103 | 7294.124 | 8087.211 | 8431.407 | 8520.754 | 8545.876 |
| 192 | 8277.928 | 9732.501 | 8535.536 | 9941.432 | 11657.998 | 8987.069 | 8045.252 | 8617.204 | 7428.247 | 7289.9 | 8087.211 | 8422.818 | 8510.274 | 8545.876 |
| 193 | 8263.822 | 9729.121 | 8521.949 | 9930.661 | 11657.998 | 8987.069 | 8036.423 | 8617.204 | 7420.444 | 7285.297 | 8087.211 | 8414.247 | 8499.861 | 8545.876 |
| 194 | 8249.828 | 9725.743 | 8508.458 | 9919.913 | 11657.998 | 8987.069 | 8027.656 | 8617.204 | 7412.695 | 7280.892 | 8087.211 | 8405.693 | 8489.513 | 8545.876 |
| 195 | 8235.943 | 9722.37 | 8495.063 | 9909.189 | 11657.998 | 8987.069 | 8018.948 | 8617.204 | 7404.998 | 7276.301 | 8087.211 | 8394.315 | 8479.23 | 8545.876 |
| 196 | 8222.166 | 9719 | 8481.762 | 9898.488 | 11657.998 | 8987.069 | 8010.3 | 8617.204 | 7397.353 | 7272.097 | 8087.211 | 8385.801 | 8469.011 | 8545.876 |
| 197 | 8208.496 | 9715.634 | 8468.555 | 9887.81 | 11657.998 | 8987.069 | 8001.711 | 8617.204 | 7389.759 | 7267.708 | 8087.211 | 8377.305 | 8458.856 | 8545.876 |
| 198 | 8194.931 | 9712.271 | 8455.441 | 9877.155 | 11657.998 | 8987.069 | 7993.179 | 8617.204 | 7382.216 | 7263.514 | 8087.211 | 8368.826 | 8448.763 | 8545.876 |
| 199 | 8181.47 | 9708.912 | 8442.421 | 9866.523 | 11657.998 | 8987.069 | 7984.705 | 8617.204 | 7374.722 | 7259.135 | 8087.211 | 8360.364 | 8438.732 | 8545.876 |
| 200 | 8168.111 | 9705.557 | 8429.492 | 9855.914 | 11657.998 | 8987.069 | 7976.287 | 8617.204 | 7367.278 | 7254.761 | 8087.211 | 8351.919 | 8428.762 | 8545.876 |
| 201 | 8154.854 | 9702.205 | 8416.654 | 9845.328 | 11657.998 | 8987.069 | 7967.925 | 8617.204 | 7359.883 | 7250.583 | 8087.211 | 8343.491 | 8418.853 | 8545.876 |
| 202 | 8141.696 | 9698.857 | 8403.907 | 9834.764 | 11657.998 | 8987.069 | 7959.619 | 8617.204 | 7352.535 | 7246.219 | 8087.211 | 8335.081 | 8409.003 | 8545.876 |
| 203 | 8128.637 | 9695.512 | 8391.251 | 9824.223 | 11657.998 | 8987.069 | 7951.366 | 8617.204 | 7345.236 | 7242.05 | 8087.211 | 8326.687 | 8399.213 | 8545.876 |
| 204 | 8115.675 | 9692.171 | 8378.683 | 9813.704 | 11657.998 | 8987.069 | 7943.168 | 8617.204 | 7337.983 | 7237.697 | 8087.211 | 8318.31 | 8389.481 | 8545.876 |
| 205 | 8102.808 | 9688.833 | 8366.204 | 9803.209 | 11657.998 | 8987.069 | 7935.023 | 8617.204 | 7330.777 | 7233.349 | 8087.211 | 8312.735 | 8379.806 | 8545.876 |
| 206 | 8090.037 | 9685.499 | 8353.814 | 9792.735 | 11657.998 | 8987.069 | 7926.931 | 8617.204 | 7323.617 | 7229.384 | 8087.211 | 8304.386 | 8370.189 | 8545.876 |
| 207 | 8077.358 | 9682.168 | 8341.511 | 9782.284 | 11657.998 | 8987.069 | 7918.89 | 8617.204 | 7316.502 | 7225.046 | 8087.211 | 8296.054 | 8360.627 | 8545.876 |
| 208 | 8064.772 | 9678.841 | 8329.295 | 9771.855 | 11657.998 | 8987.069 | 7910.902 | 8617.204 | 7309.432 | 7221.089 | 8087.211 | 8287.738 | 8351.122 | 8545.876 |
| 209 | 8052.277 | 9675.517 | 8317.165 | 9764.915 | 11657.998 | 8987.069 | 7902.963 | 8617.204 | 7302.407 | 7216.761 | 8087.211 | 8279.439 | 8341.672 | 8545.876 |
| 210 | 8039.872 | 9672.196 | 8305.121 | 9754.523 | 11657.998 | 8987.069 | 7895.075 | 8617.204 | 7295.425 | 7212.814 | 8087.211 | 8271.157 | 8332.276 | 8545.876 |
| 211 | 8027.555 | 9668.879 | 8293.162 | 9744.153 | 11657.998 | 8987.069 | 7887.237 | 8617.204 | 7288.487 | 7208.496 | 8087.211 | 8262.891 | 8322.934 | 8545.876 |
| 212 | 8015.327 | 9665.565 | 8281.287 | 9733.805 | 11657.998 | 8987.069 | 7879.448 | 8617.204 | 7281.591 | 7204.558 | 8087.211 | 8254.642 | 8313.645 | 8545.876 |
| 213 | 8003.184 | 9662.255 | 8269.496 | 9723.479 | 11657.998 | 8987.069 | 7871.707 | 8617.204 | 7274.738 | 7200.437 | 8087.211 | 8249.152 | 8304.409 | 8545.876 |
| 214 | 7991.128 | 9658.948 | 8257.789 | 9716.608 | 11657.998 | 8987.069 | 7864.014 | 8617.204 | 7267.927 | 7196.32 | 8087.211 | 8240.93 | 8295.225 | 8545.876 |
| 215 | 7979.155 | 9655.644 | 8246.165 | 9706.318 | 11657.998 | 8987.069 | 7856.369 | 8617.204 | 7261.157 | 7192.209 | 8087.211 | 8232.725 | 8286.093 | 8545.876 |
| 216 | 7967.266 | 9652.344 | 8234.623 | 9696.051 | 11657.998 | 8987.069 | 7848.771 | 8617.204 | 7254.428 | 7188.288 | 8087.211 | 8224.536 | 8277.012 | 8545.876 |
| 217 | 7955.46 | 9649.047 | 8223.162 | 9685.805 | 11657.998 | 8987.069 | 7841.219 | 8617.204 | 7247.74 | 7184.186 | 8087.211 | 8216.363 | 8267.981 | 8545.876 |
| 218 | 7943.734 | 9645.753 | 8211.783 | 9675.581 | 11657.998 | 8987.069 | 7833.712 | 8617.204 | 7241.092 | 7180.274 | 8087.211 | 8210.924 | 8259 | 8545.876 |
| 219 | 7932.089 | 9642.463 | 8200.484 | 9668.776 | 11657.998 | 8987.069 | 7826.251 | 8617.204 | 7234.483 | 7176.181 | 8087.211 | 8202.778 | 8250.068 | 8545.876 |
| 220 | 7920.524 | 9639.175 | 8189.266 | 9658.588 | 11657.998 | 8987.069 | 7818.835 | 8617.204 | 7227.914 | 7172.278 | 8087.211 | 8194.648 | 8241.185 | 8545.876 |
| 221 | 7909.037 | 9635.892 | 8178.126 | 9648.421 | 11657.998 | 8987.069 | 7811.464 | 8617.204 | 7221.383 | 7168.194 | 8087.211 | 8186.535 | 8232.35 | 8545.876 |
| 222 | 7897.627 | 9632.611 | 8167.066 | 9641.655 | 11657.998 | 8987.069 | 7804.136 | 8617.204 | 7214.891 | 7164.485 | 8087.211 | 8181.135 | 8223.563 | 8545.876 |
| 223 | 7886.294 | 9629.333 | 8156.085 | 9631.524 | 11657.998 | 8987.069 | 7796.852 | 8617.204 | 7208.437 | 7160.595 | 8087.211 | 8173.048 | 8214.824 | 8545.876 |
| 224 | 7875.036 | 9626.059 | 8145.181 | 9621.414 | 11657.998 | 8987.069 | 7789.61 | 8617.204 | 7202.02 | 7156.524 | 8087.211 | 8164.977 | 8206.131 | 8545.876 |
| 225 | 7863.854 | 9622.788 | 8134.355 | 9614.685 | 11657.998 | 8987.069 | 7782.411 | 8617.204 | 7195.641 | 7152.827 | 8087.211 | 8156.922 | 8197.485 | 8545.876 |
| 226 | 7852.745 | 9619.52 | 8123.606 | 9604.611 | 11657.998 | 8987.069 | 7775.254 | 8617.204 | 7189.298 | 7148.765 | 8087.211 | 8151.561 | 8188.884 | 8545.876 |
| 227 | 7841.709 | 9616.256 | 8112.933 | 9594.557 | 11657.998 | 8987.069 | 7768.139 | 8617.204 | 7182.991 | 7145.076 | 8087.211 | 8143.533 | 8180.329 | 8545.876 |
| 228 | 7830.746 | 9612.994 | 8102.337 | 9587.866 | 11657.998 | 8987.069 | 7761.065 | 8617.204 | 7176.721 | 7141.207 | 8087.211 | 8135.52 | 8171.818 | 8545.876 |
| 229 | 7819.854 | 9609.736 | 8091.816 | 9577.847 | 11657.998 | 8987.069 | 7754.031 | 8617.204 | 7170.486 | 7137.342 | 8087.211 | 8130.187 | 8163.352 | 8545.876 |
| 230 | 7809.032 | 9606.48 | 8081.37 | 9567.85 | 11657.998 | 8987.069 | 7747.038 | 8617.204 | 7164.287 | 7133.665 | 8087.211 | 8122.2 | 8154.93 | 8545.876 |
| 231 | 7798.28 | 9603.228 | 8070.998 | 9561.196 | 11657.998 | 8987.069 | 7740.084 | 8617.204 | 7158.122 | 7129.624 | 8087.211 | 8116.885 | 8146.552 | 8545.876 |
| 232 | 7787.598 | 9599.979 | 8060.701 | 9551.233 | 11657.998 | 8987.069 | 7733.17 | 8617.204 | 7151.992 | 7125.955 | 8087.211 | 8108.924 | 8138.216 | 8545.876 |
| 233 | 7776.983 | 9596.733 | 8050.477 | 9544.603 | 11657.998 | 8987.069 | 7726.296 | 8617.204 | 7145.895 | 7122.29 | 8087.211 | 8100.98 | 8129.923 | 8545.876 |
| 234 | 7766.436 | 9593.491 | 8040.326 | 9534.674 | 11657.998 | 8987.069 | 7719.459 | 8617.204 | 7139.833 | 7118.445 | 8087.211 | 8095.692 | 8121.673 | 8545.876 |
| 235 | 7755.955 | 9590.251 | 8030.248 | 9524.766 | 11657.998 | 8987.069 | 7712.661 | 8617.204 | 7133.804 | 7114.788 | 8087.211 | 8087.773 | 8113.464 | 8545.876 |
| 236 | 7745.54 | 9587.014 | 8020.242 | 9518.172 | 11657.998 | 8987.069 | 7705.901 | 8617.204 | 7127.809 | 7111.134 | 8087.211 | 8082.502 | 8105.297 | 8545.876 |
| 237 | 7735.19 | 9583.781 | 8010.308 | 9508.299 | 11657.998 | 8987.069 | 7699.178 | 8617.204 | 7121.846 | 7107.301 | 8087.211 | 8074.609 | 8097.17 | 8545.876 |
| 238 | 7724.905 | 9580.55 | 8000.446 | 9501.728 | 11657.998 | 8987.069 | 7692.492 | 8617.204 | 7115.915 | 7103.655 | 8087.211 | 8066.732 | 8089.084 | 8545.876 |
| 239 | 7714.684 | 9577.323 | 7990.654 | 9491.888 | 11657.998 | 8987.069 | 7685.843 | 8617.204 | 7110.017 | 7100.195 | 8087.211 | 8061.488 | 8081.039 | 8545.876 |
| 240 | 7704.525 | 9574.098 | 7980.933 | 9485.34 | 11657.998 | 8987.069 | 7679.23 | 8617.204 | 7104.15 | 7096.374 | 8087.211 | 8053.636 | 8073.033 | 8545.876 |
| 241 | 7694.429 | 9570.877 | 7971.282 | 9475.534 | 11657.998 | 8987.069 | 7672.654 | 8617.204 | 7098.315 | 7092.739 | 8087.211 | 8048.41 | 8065.066 | 8545.876 |
| 242 | 7684.395 | 9567.658 | 7961.701 | 9469.008 | 11657.998 | 8987.069 | 7666.112 | 8617.204 | 7092.511 | 7089.289 | 8087.211 | 8040.583 | 8057.139 | 8545.876 |
| 243 | 7674.421 | 9564.443 | 7952.188 | 9459.236 | 11657.998 | 8987.069 | 7659.607 | 8617.204 | 7086.738 | 7085.662 | 8087.211 | 8035.374 | 8049.25 | 8545.876 |
| 244 | 7664.508 | 9561.23 | 7942.745 | 9452.733 | 11657.998 | 8987.069 | 7653.136 | 8617.204 | 7080.996 | 7082.038 | 8087.211 | 8027.573 | 8041.4 | 8545.876 |
| 245 | 7654.655 | 9558.021 | 7933.37 | 9442.995 | 11657.998 | 8987.069 | 7646.699 | 8617.204 | 7075.284 | 7078.417 | 8087.211 | 8022.38 | 8033.587 | 8545.876 |
| 246 | 7644.86 | 9554.814 | 7924.063 | 9436.513 | 11657.998 | 8987.069 | 7640.297 | 8617.204 | 7069.602 | 7074.981 | 8087.211 | 8014.604 | 8025.812 | 8545.876 |
| 247 | 7635.124 | 9551.61 | 7914.824 | 9426.808 | 11657.998 | 8987.069 | 7633.929 | 8617.204 | 7063.949 | 7071.188 | 8087.211 | 8009.428 | 8018.074 | 8545.876 |
| 248 | 7625.446 | 9548.41 | 7905.652 | 9420.349 | 11657.998 | 8987.069 | 7627.594 | 8617.204 | 7058.326 | 7067.759 | 8087.211 | 8001.677 | 8010.373 | 8545.876 |
| 249 | 7615.825 | 9545.212 | 7896.546 | 9413.899 | 11657.998 | 8987.069 | 7621.292 | 8617.204 | 7052.733 | 7064.333 | 8087.211 | 7996.518 | 8002.709 | 8545.876 |
| 250 | 7606.261 | 9542.017 | 7887.508 | 9404.241 | 11657.998 | 8987.069 | 7615.024 | 8617.204 | 7047.168 | 7060.911 | 8087.211 | 7988.792 | 7995.081 | 8545.876 |
| 251 | 7596.753 | 9538.825 | 7878.535 | 9397.813 | 11657.998 | 8987.069 | 7608.788 | 8617.204 | 7041.631 | 7057.492 | 8087.211 | 7983.65 | 7987.488 | 8545.876 |
| 252 | 7587.3 | 9535.636 | 7869.627 | 9388.187 | 11657.998 | 8987.069 | 7602.584 | 8617.204 | 7036.123 | 7053.897 | 8087.211 | 7978.514 | 7979.931 | 8545.876 |
| 253 | 7577.902 | 9532.45 | 7860.786 | 9381.781 | 11657.998 | 8987.069 | 7596.412 | 8617.204 | 7030.643 | 7050.485 | 8087.211 | 7970.823 | 7972.409 | 8545.876 |
| 254 | 7568.558 | 9529.267 | 7852.009 | 9375.384 | 11657.998 | 8987.069 | 7590.272 | 8617.204 | 7025.19 | 7047.076 | 8087.211 | 7965.703 | 7964.922 | 8545.876 |
| 255 | 7559.268 | 9526.086 | 7843.296 | 9365.804 | 11657.998 | 8987.069 | 7584.164 | 8617.204 | 7019.766 | 7043.671 | 8087.211 | 7958.037 | 7957.47 | 8545.876 |
| 256 | 7550.031 | 9522.909 | 7834.648 | 9359.428 | 11657.998 | 8987.069 | 7578.086 | 8617.204 | 7014.368 | 7040.268 | 8087.211 | 7952.934 | 7950.052 | 8545.876 |
| 257 | 7540.846 | 9519.734 | 7826.063 | 9349.881 | 11657.998 | 8987.069 | 7572.04 | 8617.204 | 7008.997 | 7036.691 | 8087.211 | 7947.837 | 7942.668 | 8545.876 |
| 258 | 7531.714 | 9516.562 | 7817.543 | 9343.527 | 11657.998 | 8987.069 | 7566.023 | 8617.204 | 7003.654 | 7033.474 | 8087.211 | 7940.205 | 7935.317 | 8545.876 |
| 259 | 7522.634 | 9513.393 | 7809.085 | 9337.182 | 11657.998 | 8987.069 | 7560.037 | 8617.204 | 6998.336 | 7030.081 | 8087.211 | 7935.125 | 7928 | 8545.876 |
| 260 | 7513.604 | 9510.227 | 7800.69 | 9327.68 | 11657.998 | 8987.069 | 7554.081 | 8617.204 | 6993.045 | 7026.692 | 8087.211 | 7927.517 | 7920.715 | 8545.876 |
| 261 | 7504.625 | 9507.064 | 7792.357 | 9321.356 | 11657.998 | 8987.069 | 7548.155 | 8617.204 | 6987.78 | 7023.485 | 8087.211 | 7922.453 | 7913.464 | 8545.876 |
| 262 | 7495.696 | 9503.903 | 7784.086 | 9315.041 | 11657.998 | 8987.069 | 7542.258 | 8617.204 | 6982.541 | 7020.102 | 8087.211 | 7917.395 | 7906.244 | 8545.876 |
| 263 | 7486.817 | 9500.745 | 7775.877 | 9305.584 | 11657.998 | 8987.069 | 7536.39 | 8617.204 | 6977.327 | 7016.722 | 8087.211 | 7909.821 | 7899.057 | 8545.876 |
| 264 | 7477.986 | 9497.59 | 7767.73 | 9299.29 | 11657.998 | 8987.069 | 7530.551 | 8617.204 | 6972.139 | 7013.524 | 8087.211 | 7904.78 | 7891.902 | 8545.876 |
| 265 | 7469.205 | 9494.438 | 7759.644 | 9293.004 | 11657.998 | 8987.069 | 7524.741 | 8617.204 | 6966.976 | 7010.151 | 8087.211 | 7899.745 | 7884.778 | 8545.876 |
| 266 | 7460.471 | 9491.289 | 7751.618 | 9283.592 | 11657.998 | 8987.069 | 7518.959 | 8617.204 | 6961.838 | 7006.958 | 8087.211 | 7892.205 | 7877.686 | 8545.876 |
| 267 | 7451.785 | 9488.142 | 7742.195 | 9277.328 | 11657.998 | 8987.069 | 7513.205 | 8617.204 | 6956.724 | 7003.768 | 8087.211 | 7887.186 | 7870.625 | 8545.876 |
| 268 | 7443.146 | 9484.998 | 7739.488 | 9271.072 | 11657.998 | 8987.069 | 7507.479 | 8617.204 | 6951.635 | 7000.581 | 8087.211 | 7882.173 | 7863.594 | 8545.876 |
| 269 | 7434.554 | 9481.857 | 7736.785 | 9264.825 | 11657.998 | 8987.069 | 7501.78 | 8617.204 | 6946.569 | 6997.397 | 8087.211 | 7874.667 | 7856.594 | 8545.876 |
| 270 | 7426.008 | 9478.719 | 7734.086 | 9255.47 | 11657.998 | 8987.069 | 7496.109 | 8617.204 | 6941.528 | 6994.216 | 8087.211 | 7869.67 | 7849.624 | 8545.876 |
| 271 | 7417.508 | 9475.583 | 7731.389 | 9249.243 | 11657.998 | 8987.069 | 7490.465 | 8617.204 | 6936.511 | 6991.038 | 8087.211 | 7864.68 | 7842.684 | 8545.876 |
| 272 | 7409.053 | 9472.45 | 7728.696 | 9243.025 | 11657.998 | 8987.069 | 7484.848 | 8617.204 | 6931.518 | 6987.863 | 8087.211 | 7859.696 | 7835.774 | 8545.876 |
| 273 | 7400.643 | 9469.32 | 7726.006 | 9236.816 | 11657.998 | 8987.069 | 7479.257 | 8617.204 | 6926.547 | 6984.691 | 8087.211 | 7852.232 | 7828.893 | 8545.876 |
| 274 | 7392.278 | 9466.192 | 7723.32 | 9227.517 | 11657.998 | 8987.069 | 7473.693 | 8617.204 | 6921.6 | 6981.345 | 8087.211 | 7847.264 | 7822.042 | 8545.876 |
| 275 | 7383.956 | 9463.067 | 7720.636 | 9221.328 | 11657.998 | 8987.069 | 7468.155 | 8617.204 | 6916.676 | 6978.53 | 8087.211 | 7842.302 | 7815.219 | 8545.876 |
| 276 | 7375.679 | 9459.945 | 7717.956 | 9215.147 | 11657.998 | 8987.069 | 7462.643 | 8617.204 | 6911.775 | 6975.191 | 8087.211 | 7837.346 | 7808.425 | 8545.876 |
| 277 | 7367.444 | 9456.826 | 7715.279 | 9208.975 | 11657.998 | 8987.069 | 7457.157 | 8617.204 | 6906.896 | 6972.205 | 8087.211 | 7829.924 | 7801.66 | 8545.876 |
| 278 | 7359.253 | 9453.709 | 7712.606 | 9202.811 | 11657.998 | 8987.069 | 7451.696 | 8617.204 | 6902.039 | 6969.047 | 8087.211 | 7824.984 | 7794.923 | 8545.876 |
| 279 | 7351.104 | 9450.595 | 7709.935 | 9193.581 | 11657.998 | 8987.069 | 7446.261 | 8617.204 | 6897.205 | 6966.067 | 8087.211 | 7820.05 | 7788.214 | 8545.876 |
| 280 | 7342.997 | 9447.483 | 7707.268 | 9187.437 | 11657.998 | 8987.069 | 7440.85 | 8617.204 | 6892.393 | 6962.915 | 8087.211 | 7815.123 | 7781.533 | 8545.876 |
| 281 | 7334.931 | 9444.374 | 7704.604 | 9181.302 | 11657.998 | 8987.069 | 7435.465 | 8617.204 | 6887.603 | 6959.94 | 8087.211 | 7807.743 | 7774.879 | 8545.876 |
| 282 | 7326.907 | 9441.268 | 7701.944 | 9175.175 | 11657.998 | 8987.069 | 7430.104 | 8617.204 | 6882.834 | 6956.793 | 8087.211 | 7802.831 | 7768.253 | 8545.876 |
| 283 | 7318.924 | 9438.165 | 7699.286 | 9169.056 | 11657.998 | 8987.069 | 7424.767 | 8617.204 | 6878.087 | 6953.823 | 8087.211 | 7797.925 | 7761.653 | 8545.876 |
| 284 | 7310.982 | 9435.064 | 7696.632 | 9159.893 | 11657.998 | 8987.069 | 7419.455 | 8617.204 | 6873.361 | 6950.856 | 8087.211 | 7793.025 | 7755.081 | 8545.876 |
| 285 | 7303.079 | 9431.965 | 7693.981 | 9153.795 | 11657.998 | 8987.069 | 7414.167 | 8617.204 | 6868.656 | 6948.066 | 8087.211 | 7788.132 | 7748.535 | 8545.876 |
| 286 | 7295.217 | 9428.87 | 7691.333 | 9147.705 | 11657.998 | 8987.069 | 7408.902 | 8617.204 | 6863.972 | 6945.103 | 8087.211 | 7783.244 | 7742.016 | 8545.876 |
| 287 | 7287.394 | 9425.777 | 7688.688 | 9141.622 | 11657.998 | 8987.069 | 7403.661 | 8617.204 | 6859.309 | 6942.144 | 8087.211 | 7775.925 | 7735.523 | 8545.876 |
| 288 | 7279.61 | 9422.686 | 7686.047 | 9135.548 | 11657.998 | 8987.069 | 7398.444 | 8617.204 | 6854.666 | 6939.187 | 8087.211 | 7771.053 | 7729.056 | 8545.876 |
| 289 | 7271.864 | 9419.598 | 7683.409 | 9129.482 | 11657.998 | 8987.069 | 7393.25 | 8617.204 | 6850.044 | 6936.232 | 8087.211 | 7766.187 | 7722.615 | 8545.876 |
| 290 | 7264.157 | 9416.513 | 7680.774 | 9123.424 | 11657.998 | 8987.069 | 7388.079 | 8617.204 | 6845.442 | 6933.28 | 8087.211 | 7761.327 | 7716.199 | 8545.876 |
| 291 | 7256.488 | 9413.43 | 7678.142 | 9114.352 | 11657.998 | 8987.069 | 7382.93 | 8617.204 | 6840.86 | 6930.33 | 8087.211 | 7756.473 | 7709.809 | 8545.876 |
| 292 | 7248.857 | 9410.35 | 7675.513 | 9108.314 | 11657.998 | 8987.069 | 7377.805 | 8617.204 | 6836.298 | 6927.557 | 8087.211 | 7751.625 | 7703.444 | 8545.876 |
| 293 | 7241.263 | 9407.272 | 7672.888 | 9102.284 | 11657.998 | 8987.069 | 7372.701 | 8617.204 | 6831.756 | 6924.612 | 8087.211 | 7746.783 | 7697.105 | 8545.876 |
| 294 | 7233.707 | 9404.197 | 7670.266 | 9096.262 | 11657.998 | 8987.069 | 7367.621 | 8617.204 | 6827.233 | 6921.67 | 8087.211 | 7739.532 | 7690.79 | 8545.876 |
| 295 | 7226.187 | 9401.125 | 7667.647 | 9090.248 | 11657.998 | 8987.069 | 7362.562 | 8617.204 | 6822.73 | 6918.903 | 8087.211 | 7734.705 | 7684.499 | 8545.876 |
| 296 | 7218.703 | 9398.055 | 7665.031 | 9084.242 | 11657.998 | 8987.069 | 7357.525 | 8617.204 | 6818.246 | 6915.965 | 8087.211 | 7729.885 | 7678.233 | 8545.876 |
| 297 | 7211.255 | 9394.988 | 7662.418 | 9078.244 | 11657.998 | 8987.069 | 7352.51 | 8617.204 | 6813.782 | 6913.203 | 8087.211 | 7725.07 | 7671.991 | 8545.876 |
| 298 | 7203.844 | 9391.923 | 7659.808 | 9072.253 | 11657.998 | 8987.069 | 7347.517 | 8617.204 | 6809.336 | 6910.443 | 8087.211 | 7720.261 | 7665.774 | 8545.876 |
| 299 | 7196.467 | 9388.86 | 7657.202 | 9066.271 | 11657.998 | 8987.069 | 7342.544 | 8617.204 | 6804.909 | 6907.685 | 8087.211 | 7715.459 | 7659.58 | 8545.876 |
| 300 | 7189.126 | 9385.801 | 7654.599 | 9060.297 | 11657.998 | 8987.069 | 7337.594 | 8617.204 | 6800.501 | 6904.929 | 8087.211 | 7710.662 | 7653.41 | 8545.876 |
| 301 | 7181.82 | 9382.743 | 7651.998 | 9054.33 | 11657.998 | 8987.069 | 7332.664 | 8617.204 | 6796.111 | 6902.176 | 8087.211 | 7705.871 | 7647.263 | 8545.876 |
| 302 | 7174.548 | 9379.689 | 7649.401 | 9048.371 | 11657.998 | 8987.069 | 7327.755 | 8617.204 | 6791.74 | 6899.253 | 8087.211 | 7701.087 | 7641.14 | 8545.876 |
| 303 | 7167.311 | 9376.636 | 7646.807 | 9042.42 | 11657.998 | 8987.069 | 7322.867 | 8617.204 | 6787.386 | 6896.504 | 8087.211 | 7696.308 | 7635.04 | 8545.876 |
| 304 | 7160.107 | 9373.586 | 7644.217 | 9033.509 | 11657.998 | 8987.069 | 7317.999 | 8617.204 | 6783.051 | 6893.757 | 8087.211 | 7691.535 | 7628.963 | 8545.876 |
| 305 | 7152.937 | 9370.539 | 7641.629 | 9027.577 | 11657.998 | 8987.069 | 7313.152 | 8617.204 | 6778.734 | 6891.184 | 8087.211 | 7684.387 | 7622.908 | 8545.876 |
| 306 | 7145.801 | 9367.494 | 7639.044 | 9021.654 | 11657.998 | 8987.069 | 7308.326 | 8617.204 | 6774.435 | 6888.441 | 8087.211 | 7679.628 | 7616.876 | 8545.876 |
| 307 | 7138.698 | 9364.452 | 7636.463 | 9015.738 | 11657.998 | 8987.069 | 7303.519 | 8617.204 | 6770.154 | 6885.872 | 8087.211 | 7674.876 | 7610.867 | 8545.876 |
| 308 | 7131.627 | 9361.412 | 7633.885 | 9009.83 | 11657.998 | 8987.069 | 7298.732 | 8617.204 | 6765.89 | 6883.134 | 8087.211 | 7670.13 | 7604.88 | 8545.876 |
| 309 | 7124.589 | 9358.375 | 7631.309 | 9003.929 | 11657.998 | 8987.069 | 7293.965 | 8617.204 | 6761.643 | 6880.568 | 8087.211 | 7665.389 | 7598.916 | 8545.876 |
| 310 | 7117.584 | 9355.34 | 7628.737 | 8998.037 | 11657.998 | 8987.069 | 7289.218 | 8617.204 | 6757.414 | 6877.834 | 8087.211 | 7660.655 | 7592.973 | 8545.876 |
| 311 | 7110.61 | 9352.307 | 7626.168 | 8992.152 | 11657.998 | 8987.069 | 7284.49 | 8617.204 | 6753.202 | 6875.273 | 8087.211 | 7655.926 | 7587.052 | 8545.876 |
| 312 | 7103.669 | 9349.277 | 7623.602 | 8986.275 | 11657.998 | 8987.069 | 7279.781 | 8617.204 | 6749.007 | 6872.543 | 8087.211 | 7651.203 | 7581.152 | 8545.876 |
| 313 | 7096.758 | 9346.249 | 7621.039 | 8980.405 | 11657.998 | 8987.069 | 7275.092 | 8617.204 | 6744.828 | 6870.156 | 8087.211 | 7646.486 | 7575.274 | 8545.876 |
| 314 | 7089.879 | 9343.224 | 7618.48 | 8974.543 | 11657.998 | 8987.069 | 7270.422 | 8617.204 | 6740.667 | 6867.43 | 8087.211 | 7641.774 | 7569.418 | 8545.876 |
| 315 | 7083.031 | 9340.201 | 7615.923 | 8968.689 | 11657.998 | 8987.069 | 7265.77 | 8617.204 | 6736.522 | 6864.877 | 8087.211 | 7637.069 | 7563.582 | 8545.876 |
| 316 | 7076.214 | 9337.181 | 7613.369 | 8962.842 | 11657.998 | 8987.069 | 7261.138 | 8617.204 | 6732.394 | 6862.155 | 8087.211 | 7632.369 | 7557.768 | 8545.876 |
| 317 | 7069.427 | 9334.163 | 7610.819 | 8957.003 | 11657.998 | 8987.069 | 7256.524 | 8617.204 | 6728.282 | 6859.606 | 8087.211 | 7627.675 | 7551.975 | 8545.876 |
| 318 | 7062.671 | 9331.147 | 7608.271 | 8954.087 | 11657.998 | 8987.069 | 7251.928 | 8617.204 | 6724.186 | 6857.228 | 8087.211 | 7622.987 | 7546.202 | 8545.876 |
| 319 | 7055.944 | 9328.134 | 7605.727 | 8948.259 | 11657.998 | 8987.069 | 7247.351 | 8617.204 | 6720.107 | 6854.682 | 8087.211 | 7618.305 | 7540.45 | 8545.876 |
| 320 | 7049.247 | 9325.124 | 7603.185 | 8942.439 | 11657.998 | 8987.069 | 7242.792 | 8617.204 | 6716.043 | 6852.138 | 8087.211 | 7613.628 | 7534.718 | 8545.876 |
| 321 | 7042.58 | 9322.115 | 7600.647 | 8936.627 | 11657.998 | 8987.069 | 7238.251 | 8617.204 | 6711.996 | 6849.596 | 8087.211 | 7608.957 | 7529.006 | 8545.876 |
| 322 | 7035.942 | 9319.109 | 7598.112 | 8930.822 | 11657.998 | 8987.069 | 7233.728 | 8617.204 | 6707.964 | 6847.055 | 8087.211 | 7604.292 | 7523.315 | 8545.876 |
| 323 | 7029.333 | 9316.106 | 7595.58 | 8925.024 | 11657.998 | 8987.069 | 7229.223 | 8617.204 | 6703.948 | 6844.686 | 8087.211 | 7599.632 | 7517.644 | 8545.876 |
| 324 | 7022.753 | 9313.105 | 7593.05 | 8919.235 | 11657.998 | 8987.069 | 7224.736 | 8617.204 | 6699.947 | 6842.319 | 8087.211 | 7597.305 | 7511.992 | 8545.876 |
| 325 | 7016.201 | 9310.106 | 7590.524 | 8913.452 | 11657.998 | 8987.069 | 7220.266 | 8617.204 | 6695.962 | 6839.784 | 8087.211 | 7592.654 | 7506.36 | 8545.876 |
| 326 | 7009.678 | 9307.109 | 7588.001 | 8907.677 | 11657.998 | 8987.069 | 7215.813 | 8617.204 | 6691.993 | 6837.251 | 8087.211 | 7588.009 | 7500.748 | 8545.876 |
| 327 | 7003.183 | 9304.115 | 7585.481 | 8901.91 | 11657.998 | 8987.069 | 7211.378 | 8617.204 | 6688.038 | 6834.888 | 8087.211 | 7583.369 | 7495.155 | 8545.876 |
| 328 | 6996.716 | 9301.123 | 7582.964 | 8896.15 | 11657.998 | 8987.069 | 7206.96 | 8617.204 | 6684.099 | 6832.527 | 8087.211 | 7578.735 | 7489.582 | 8545.876 |
| 329 | 6990.277 | 9298.134 | 7580.45 | 8890.398 | 11657.998 | 8987.069 | 7202.559 | 8617.204 | 6680.174 | 6830 | 8087.211 | 7574.107 | 7484.027 | 8545.876 |
| 330 | 6983.865 | 9295.147 | 7577.939 | 8884.653 | 11657.998 | 8987.069 | 7198.175 | 8617.204 | 6676.265 | 6827.811 | 8087.211 | 7569.484 | 7478.492 | 8545.876 |
| 331 | 6977.48 | 9292.162 | 7575.431 | 8878.915 | 11657.998 | 8987.069 | 7193.807 | 8617.204 | 6672.37 | 6825.287 | 8087.211 | 7564.867 | 7472.976 | 8545.876 |
| 332 | 6971.123 | 9289.18 | 7572.926 | 8876.049 | 11657.998 | 8987.069 | 7189.457 | 8617.204 | 6668.49 | 6823.1 | 8087.211 | 7560.256 | 7467.478 | 8545.876 |
| 333 | 6964.792 | 9286.2 | 7570.424 | 8870.323 | 11657.998 | 8987.069 | 7185.123 | 8617.204 | 6664.625 | 6820.58 | 8087.211 | 7555.65 | 7461.999 | 8545.876 |
| 334 | 6958.488 | 9283.222 | 7567.925 | 8864.603 | 11657.998 | 8987.069 | 7180.805 | 8617.204 | 6660.774 | 6818.229 | 8087.211 | 7551.05 | 7456.539 | 8545.876 |
| 335 | 6952.211 | 9280.247 | 7565.429 | 8858.892 | 11657.998 | 8987.069 | 7176.504 | 8617.204 | 6656.937 | 6816.047 | 8087.211 | 7546.456 | 7451.097 | 8545.876 |
| 336 | 6945.959 | 9277.274 | 7562.935 | 8853.187 | 11657.998 | 8987.069 | 7172.219 | 8617.204 | 6653.115 | 6813.699 | 8087.211 | 7544.161 | 7445.673 | 8545.876 |
| 337 | 6939.734 | 9274.303 | 7560.445 | 8847.49 | 11657.998 | 8987.069 | 7167.95 | 8617.204 | 6649.307 | 6811.186 | 8087.211 | 7539.574 | 7440.267 | 8545.876 |
| 338 | 6933.535 | 9271.334 | 7557.958 | 8841.801 | 11657.998 | 8987.069 | 7163.697 | 8617.204 | 6645.513 | 6809.009 | 8087.211 | 7534.994 | 7434.88 | 8545.876 |
| 339 | 6927.361 | 9268.368 | 7555.474 | 8838.959 | 11657.998 | 8987.069 | 7159.459 | 8617.204 | 6641.733 | 6806.666 | 8087.211 | 7530.419 | 7429.51 | 8545.876 |
| 340 | 6921.213 | 9265.404 | 7552.993 | 8833.28 | 11657.998 | 8987.069 | 7155.238 | 8617.204 | 6637.967 | 6804.492 | 8087.211 | 7525.85 | 7424.158 | 8545.876 |
| 341 | 6915.09 | 9262.443 | 7550.515 | 8827.608 | 11657.998 | 8987.069 | 7151.032 | 8617.204 | 6634.214 | 6802.152 | 8087.211 | 7521.286 | 7418.824 | 8545.876 |
| 342 | 6908.992 | 9259.483 | 7548.039 | 8821.944 | 11657.998 | 8987.069 | 7146.842 | 8617.204 | 6630.476 | 6800.147 | 8087.211 | 7516.727 | 7413.507 | 8545.876 |
| 343 | 6902.919 | 9256.526 | 7545.567 | 8816.287 | 11657.998 | 8987.069 | 7142.667 | 8617.204 | 6626.751 | 6797.81 | 8087.211 | 7512.174 | 7408.208 | 8545.876 |
| 344 | 6896.871 | 9253.572 | 7543.098 | 8810.638 | 11657.998 | 8987.069 | 7138.508 | 8617.204 | 6623.039 | 6795.642 | 8087.211 | 7509.9 | 7402.926 | 8545.876 |
| 345 | 6890.847 | 9250.619 | 7540.631 | 8804.995 | 11657.998 | 8987.069 | 7134.364 | 8617.204 | 6619.341 | 6793.308 | 8087.211 | 7505.356 | 7397.661 | 8545.876 |
| 346 | 6884.847 | 9247.669 | 7538.168 | 8802.177 | 11657.998 | 8987.069 | 7130.234 | 8617.204 | 6615.656 | 6791.309 | 8087.211 | 7500.816 | 7392.413 | 8545.876 |
| 347 | 6878.872 | 9244.721 | 7535.707 | 8796.545 | 11657.998 | 8987.069 | 7126.12 | 8617.204 | 6611.985 | 6788.978 | 8087.211 | 7496.283 | 7387.182 | 8545.876 |
| 348 | 6872.921 | 9241.775 | 7533.25 | 8790.921 | 11657.998 | 8987.069 | 7122.021 | 8617.204 | 6608.326 | 6786.982 | 8087.211 | 7491.755 | 7381.968 | 8545.876 |
| 349 | 6866.994 | 9238.832 | 7530.795 | 8785.304 | 11657.998 | 8987.069 | 7117.937 | 8617.204 | 6604.681 | 6784.654 | 8087.211 | 7487.232 | 7376.771 | 8545.876 |
| 350 | 6861.09 | 9235.89 | 7528.343 | 8779.693 | 11657.998 | 8987.069 | 7113.867 | 8617.204 | 6601.049 | 6782.66 | 8087.211 | 7484.973 | 7371.591 | 8545.876 |
| 351 | 6855.209 | 9232.951 | 7525.895 | 8776.891 | 11657.998 | 8987.069 | 7109.812 | 8617.204 | 6597.429 | 6780.501 | 8087.211 | 7480.458 | 7366.427 | 8545.876 |
| 352 | 6849.352 | 9230.015 | 7523.449 | 8771.292 | 11657.998 | 8987.069 | 7105.771 | 8617.204 | 6593.822 | 6778.343 | 8087.211 | 7475.949 | 7361.279 | 8545.876 |
| 353 | 6843.519 | 9227.08 | 7521.006 | 8765.7 | 11657.998 | 8987.069 | 7101.745 | 8617.204 | 6590.228 | 6776.187 | 8087.211 | 7471.446 | 7356.148 | 8545.876 |
| 354 | 6837.708 | 9224.148 | 7518.566 | 8760.115 | 11657.998 | 8987.069 | 7097.733 | 8617.204 | 6586.647 | 6774.198 | 8087.211 | 7466.948 | 7351.033 | 8545.876 |
| 355 | 6831.92 | 9221.218 | 7516.128 | 8754.537 | 11657.998 | 8987.069 | 7093.736 | 8617.204 | 6583.078 | 6772.045 | 8087.211 | 7464.701 | 7345.934 | 8545.876 |
| 356 | 6826.154 | 9218.29 | 7513.694 | 8751.75 | 11657.998 | 8987.069 | 7089.752 | 8617.204 | 6579.522 | 6770.058 | 8087.211 | 7460.211 | 7340.851 | 8545.876 |
| 357 | 6820.411 | 9215.364 | 7511.263 | 8746.183 | 11657.998 | 8987.069 | 7085.783 | 8617.204 | 6575.978 | 6768.073 | 8087.211 | 7455.726 | 7335.784 | 8545.876 |
| 358 | 6814.69 | 9212.441 | 7508.834 | 8740.623 | 11657.998 | 8987.069 | 7081.827 | 8617.204 | 6572.446 | 6765.923 | 8087.211 | 7451.247 | 7330.733 | 8545.876 |
| 359 | 6808.992 | 9209.52 | 7506.409 | 8735.07 | 11657.998 | 8987.069 | 7077.886 | 8617.204 | 6568.926 | 6763.94 | 8087.211 | 7446.773 | 7325.698 | 8545.876 |
| 360 | 6803.315 | 9206.601 | 7503.986 | 8732.296 | 11657.998 | 8987.069 | 7073.958 | 8617.204 | 6565.419 | 6761.793 | 8087.211 | 7444.538 | 7320.678 | 8545.876 |
| 361 | 6797.661 | 9203.684 | 7501.566 | 8726.753 | 11657.998 | 8987.069 | 7070.044 | 8617.204 | 6561.924 | 6759.813 | 8087.211 | 7440.072 | 7315.674 | 8545.876 |
| 362 | 6792.028 | 9200.769 | 7499.149 | 8721.218 | 11657.998 | 8987.069 | 7066.143 | 8617.204 | 6558.44 | 6757.998 | 8087.211 | 7435.612 | 7310.685 | 8545.876 |
| 363 | 6786.416 | 9197.857 | 7496.735 | 8715.689 | 11657.998 | 8987.069 | 7062.256 | 8617.204 | 6554.969 | 6755.855 | 8087.211 | 7431.156 | 7305.711 | 8545.876 |
| 364 | 6780.826 | 9194.947 | 7494.324 | 8712.928 | 11657.998 | 8987.069 | 7058.382 | 8617.204 | 6551.509 | 6753.878 | 8087.211 | 7428.931 | 7300.753 | 8545.876 |
| 365 | 6775.258 | 9192.039 | 7491.916 | 8707.41 | 11657.998 | 8987.069 | 7054.521 | 8617.204 | 6548.062 | 6751.902 | 8087.211 | 7424.484 | 7295.81 | 8545.876 |
| 366 | 6769.71 | 9189.133 | 7489.51 | 8701.899 | 11657.998 | 8987.069 | 7050.674 | 8617.204 | 6544.625 | 6749.927 | 8087.211 | 7420.042 | 7290.882 | 8545.876 |
| 367 | 6764.183 | 9186.229 | 7487.108 | 8696.395 | 11657.998 | 8987.069 | 7046.84 | 8617.204 | 6541.201 | 6748.118 | 8087.211 | 7415.605 | 7285.969 | 8545.876 |
| 368 | 6758.677 | 9183.328 | 7484.708 | 8693.645 | 11657.998 | 8987.069 | 7043.019 | 8617.204 | 6537.788 | 6746.145 | 8087.211 | 7413.389 | 7281.07 | 8545.876 |
| 369 | 6753.192 | 9180.428 | 7482.311 | 8688.152 | 11657.998 | 8987.069 | 7039.211 | 8617.204 | 6534.386 | 6744.174 | 8087.211 | 7408.961 | 7276.187 | 8545.876 |
| 370 | 6747.727 | 9177.531 | 7479.917 | 8682.665 | 11657.998 | 8987.069 | 7035.416 | 8617.204 | 6530.996 | 6742.367 | 8087.211 | 7404.537 | 7271.318 | 8545.876 |
| 371 | 6742.283 | 9174.636 | 7477.526 | 8677.185 | 11657.998 | 8987.069 | 7031.633 | 8617.204 | 6527.617 | 6740.398 | 8087.211 | 7400.119 | 7266.463 | 8545.876 |
| 372 | 6736.859 | 9171.743 | 7475.137 | 8674.448 | 11657.998 | 8987.069 | 7027.864 | 8617.204 | 6524.249 | 6738.594 | 8087.211 | 7397.912 | 7261.623 | 8545.876 |
| 373 | 6731.455 | 9168.852 | 7472.752 | 8668.979 | 11657.998 | 8987.069 | 7024.107 | 8617.204 | 6520.893 | 6736.791 | 8087.211 | 7393.502 | 7256.798 | 8545.876 |
| 374 | 6726.071 | 9165.963 | 7470.369 | 8663.516 | 11657.998 | 8987.069 | 7020.362 | 8617.204 | 6517.547 | 6734.825 | 8087.211 | 7389.097 | 7251.987 | 8545.876 |
| 375 | 6720.706 | 9163.077 | 7467.989 | 8660.787 | 11657.998 | 8987.069 | 7016.63 | 8617.204 | 6514.213 | 6733.024 | 8087.211 | 7384.698 | 7247.19 | 8545.876 |
| 376 | 6715.362 | 9160.193 | 7465.612 | 8655.335 | 11657.998 | 8987.069 | 7012.911 | 8617.204 | 6510.889 | 6731.224 | 8087.211 | 7382.5 | 7242.407 | 8545.876 |
| 377 | 6710.037 | 9157.31 | 7463.238 | 8649.89 | 11657.998 | 8987.069 | 7009.203 | 8617.204 | 6507.577 | 6729.424 | 8087.211 | 7378.108 | 7237.638 | 8545.876 |
| 378 | 6704.731 | 9154.43 | 7460.866 | 8647.17 | 11657.998 | 8987.069 | 7005.508 | 8617.204 | 6504.275 | 6727.463 | 8087.211 | 7373.722 | 7232.884 | 8545.876 |
| 379 | 6699.445 | 9151.552 | 7458.498 | 8641.735 | 11657.998 | 8987.069 | 7001.826 | 8617.204 | 6500.984 | 6725.829 | 8087.211 | 7371.53 | 7228.143 | 8545.876 |
| 380 | 6694.178 | 9148.676 | 7456.132 | 8636.307 | 11657.998 | 8987.069 | 6998.155 | 8617.204 | 6497.704 | 6724.032 | 8087.211 | 7367.152 | 7223.416 | 8545.876 |
| 381 | 6688.93 | 9145.803 | 7453.769 | 8633.595 | 11657.998 | 8987.069 | 6994.496 | 8617.204 | 6494.434 | 6722.074 | 8087.211 | 7362.778 | 7218.703 | 8545.876 |
| 382 | 6683.701 | 9142.931 | 7451.409 | 8628.177 | 11657.998 | 8987.069 | 6990.85 | 8617.204 | 6491.175 | 6720.443 | 8087.211 | 7358.41 | 7214.003 | 8545.876 |
| 383 | 6678.49 | 9140.062 | 7449.051 | 8622.766 | 11657.998 | 8987.069 | 6987.215 | 8617.204 | 6487.926 | 6718.649 | 8087.211 | 7356.228 | 7209.317 | 8545.876 |
| 384 | 6673.299 | 9137.194 | 7446.697 | 8620.063 | 11657.998 | 8987.069 | 6983.592 | 8617.204 | 6484.688 | 6717.02 | 8087.211 | 7351.867 | 7204.644 | 8545.876 |
| 385 | 6668.126 | 9134.329 | 7444.345 | 8614.662 | 11657.998 | 8987.069 | 6979.98 | 8617.204 | 6481.46 | 6715.391 | 8087.211 | 7347.512 | 7199.985 | 8545.876 |
| 386 | 6662.971 | 9131.466 | 7441.996 | 8609.267 | 11657.998 | 8987.069 | 6976.381 | 8617.204 | 6478.242 | 6713.437 | 8087.211 | 7345.336 | 7195.339 | 8545.876 |
| 387 | 6657.835 | 9128.604 | 7439.649 | 8606.573 | 11657.998 | 8987.069 | 6972.793 | 8617.204 | 6475.035 | 6711.81 | 8087.211 | 7340.988 | 7190.707 | 8545.876 |
| 388 | 6652.717 | 9125.745 | 7437.306 | 8601.189 | 11657.998 | 8987.069 | 6969.216 | 8617.204 | 6471.838 | 6710.184 | 8087.211 | 7336.646 | 7186.087 | 8545.876 |
| 389 | 6647.616 | 9122.888 | 7434.965 | 8595.811 | 11657.998 | 8987.069 | 6965.651 | 8617.204 | 6468.651 | 6708.558 | 8087.211 | 7334.477 | 7181.481 | 8545.876 |
| 390 | 6642.534 | 9120.033 | 7432.627 | 8593.125 | 11657.998 | 8987.069 | 6962.097 | 8617.204 | 6465.474 | 6706.934 | 8087.211 | 7330.142 | 7176.888 | 8545.876 |
| 391 | 6637.47 | 9117.181 | 7430.292 | 8587.758 | 11657.998 | 8987.069 | 6958.555 | 8617.204 | 6462.307 | 6705.147 | 8087.211 | 7325.812 | 7172.307 | 8545.876 |
| 392 | 6632.423 | 9114.33 | 7427.959 | 8582.397 | 11657.998 | 8987.069 | 6955.024 | 8617.204 | 6459.15 | 6703.524 | 8087.211 | 7323.649 | 7167.74 | 8545.876 |
| 393 | 6627.394 | 9111.481 | 7425.63 | 8579.719 | 11657.998 | 8987.069 | 6951.504 | 8617.204 | 6456.002 | 6701.902 | 8087.211 | 7319.327 | 7163.185 | 8545.876 |
| 394 | 6622.383 | 9108.635 | 7423.303 | 8574.369 | 11657.998 | 8987.069 | 6947.995 | 8617.204 | 6452.865 | 6700.281 | 8087.211 | 7315.01 | 7158.643 | 8545.876 |
| 395 | 6617.389 | 9105.79 | 7420.978 | 8569.025 | 11657.998 | 8987.069 | 6944.497 | 8617.204 | 6449.737 | 6698.66 | 8087.211 | 7312.854 | 7154.114 | 8545.876 |
| 396 | 6612.412 | 9102.948 | 7418.657 | 8566.355 | 11657.998 | 8987.069 | 6941.01 | 8617.204 | 6446.619 | 6697.04 | 8087.211 | 7308.544 | 7149.597 | 8545.876 |
| 397 | 6607.452 | 9100.107 | 7416.338 | 8561.021 | 11657.998 | 8987.069 | 6937.534 | 8617.204 | 6443.511 | 6695.583 | 8087.211 | 7306.392 | 7145.093 | 8545.876 |
| 398 | 6602.51 | 9097.269 | 7414.022 | 8558.357 | 11657.998 | 8987.069 | 6934.069 | 8617.204 | 6440.412 | 6693.803 | 8087.211 | 7302.09 | 7140.601 | 8545.876 |
| 399 | 6597.584 | 9094.432 | 7411.709 | 8553.033 | 11657.998 | 8987.069 | 6930.615 | 8617.204 | 6437.323 | 6692.185 | 8087.211 | 7297.793 | 7136.122 | 8545.876 |
| 400 | 6592.675 | 9091.598 | 7409.398 | 8547.715 | 11657.998 | 8987.069 | 6927.171 | 8617.204 | 6434.243 | 6690.73 | 8087.211 | 7295.647 | 7131.655 | 8545.876 |
| 401 | 6587.783 | 9088.766 | 7407.091 | 8545.059 | 11657.998 | 8987.069 | 6923.738 | 8617.204 | 6431.173 | 6689.114 | 8087.211 | 7291.358 | 7127.2 | 8545.876 |
| 402 | 6582.907 | 9085.936 | 7404.786 | 8539.752 | 11657.998 | 8987.069 | 6920.316 | 8617.204 | 6428.112 | 6687.66 | 8087.211 | 7287.074 | 7122.758 | 8545.876 |
| 403 | 6578.048 | 9083.107 | 7402.483 | 8537.1 | 11657.998 | 8987.069 | 6916.904 | 8617.204 | 6425.06 | 6686.207 | 8087.211 | 7284.934 | 7118.327 | 8545.876 |
| 404 | 6573.206 | 9080.281 | 7400.184 | 8531.803 | 11657.998 | 8987.069 | 6913.503 | 8617.204 | 6422.018 | 6684.593 | 8087.211 | 7280.657 | 7113.908 | 8545.876 |
| 405 | 6568.38 | 9077.457 | 7397.887 | 8526.512 | 11657.998 | 8987.069 | 6910.112 | 8617.204 | 6418.985 | 6683.141 | 8087.211 | 7278.521 | 7109.502 | 8545.876 |
| 406 | 6563.57 | 9074.635 | 7395.592 | 8523.869 | 11657.998 | 8987.069 | 6906.731 | 8617.204 | 6415.961 | 6681.69 | 8087.211 | 7274.252 | 7105.107 | 8545.876 |
| 407 | 6558.776 | 9071.815 | 7393.301 | 8518.587 | 11657.998 | 8987.069 | 6903.361 | 8617.204 | 6412.946 | 6680.239 | 8087.211 | 7269.988 | 7100.724 | 8545.876 |
| 408 | 6553.998 | 9068.997 | 7391.012 | 8515.949 | 11657.998 | 8987.069 | 6900.001 | 8617.204 | 6409.94 | 6678.789 | 8087.211 | 7267.858 | 7096.353 | 8545.876 |
| 409 | 6549.236 | 9066.181 | 7388.726 | 8510.678 | 11657.998 | 8987.069 | 6896.651 | 8617.204 | 6406.943 | 6677.34 | 8087.211 | 7263.602 | 7091.994 | 8545.876 |
| 410 | 6544.49 | 9063.367 | 7386.442 | 8505.413 | 11657.998 | 8987.069 | 6893.311 | 8617.204 | 6403.955 | 6675.891 | 8087.211 | 7261.475 | 7087.646 | 8545.876 |
| 411 | 6539.759 | 9060.555 | 7384.162 | 8502.783 | 11657.998 | 8987.069 | 6889.982 | 8617.204 | 6400.976 | 6674.443 | 8087.211 | 7257.226 | 7083.31 | 8545.876 |
| 412 | 6535.045 | 9057.745 | 7381.884 | 8497.528 | 11657.998 | 8987.069 | 6886.662 | 8617.204 | 6398.005 | 6672.835 | 8087.211 | 7252.982 | 7078.985 | 8545.876 |
| 413 | 6530.345 | 9054.937 | 7379.608 | 8494.903 | 11657.998 | 8987.069 | 6883.352 | 8617.204 | 6395.044 | 6671.71 | 8087.211 | 7250.862 | 7074.672 | 8545.876 |
| 414 | 6525.661 | 9052.131 | 7377.335 | 8489.657 | 11657.998 | 8987.069 | 6880.052 | 8617.204 | 6392.091 | 6670.264 | 8087.211 | 7246.626 | 7070.37 | 8545.876 |
| 415 | 6520.993 | 9049.327 | 7375.065 | 8487.037 | 11657.998 | 8987.069 | 6876.762 | 8617.204 | 6389.147 | 6668.657 | 8087.211 | 7244.509 | 7066.08 | 8545.876 |
| 416 | 6516.34 | 9046.525 | 7372.798 | 8481.801 | 11657.998 | 8987.069 | 6873.482 | 8617.204 | 6386.212 | 6667.533 | 8087.211 | 7240.28 | 7061.801 | 8545.876 |
| 417 | 6511.702 | 9043.724 | 7370.533 | 8476.572 | 11657.998 | 8987.069 | 6870.211 | 8617.204 | 6383.285 | 6666.089 | 8087.211 | 7238.167 | 7057.533 | 8545.876 |
| 418 | 6507.079 | 9040.926 | 7368.271 | 8473.96 | 11657.998 | 8987.069 | 6866.95 | 8617.204 | 6380.367 | 6664.806 | 8087.211 | 7233.946 | 7053.276 | 8545.876 |
| 419 | 6502.47 | 9038.13 | 7366.012 | 8468.74 | 11657.998 | 8987.069 | 6863.699 | 8617.204 | 6377.457 | 6663.362 | 8087.211 | 7229.729 | 7049.03 | 8545.876 |
| 420 | 6497.877 | 9035.336 | 7363.755 | 8466.133 | 11657.998 | 8987.069 | 6860.457 | 8617.204 | 6374.556 | 6662.08 | 8087.211 | 7227.622 | 7044.795 | 8545.876 |
| 421 | 6493.299 | 9032.544 | 7361.501 | 8460.923 | 11657.998 | 8987.069 | 6857.225 | 8617.204 | 6371.663 | 6660.798 | 8087.211 | 7223.413 | 7040.572 | 8545.876 |
| 422 | 6488.735 | 9029.754 | 7359.25 | 8458.321 | 11657.998 | 8987.069 | 6854.002 | 8617.204 | 6368.778 | 6659.357 | 8087.211 | 7221.31 | 7036.359 | 8545.876 |
| 423 | 6484.186 | 9026.965 | 7357.001 | 8453.12 | 11657.998 | 8987.069 | 6850.788 | 8617.204 | 6365.902 | 6658.076 | 8087.211 | 7217.108 | 7032.157 | 8545.876 |
| 424 | 6479.652 | 9024.179 | 7354.755 | 8450.522 | 11657.998 | 8987.069 | 6847.584 | 8617.204 | 6363.034 | 6656.795 | 8087.211 | 7215.009 | 7027.966 | 8545.876 |
| 425 | 6475.132 | 9021.395 | 7352.511 | 8445.332 | 11657.998 | 8987.069 | 6844.389 | 8617.204 | 6360.174 | 6655.516 | 8087.211 | 7210.814 | 7023.785 | 8545.876 |
| 426 | 6470.626 | 9018.613 | 7350.27 | 8442.739 | 11657.998 | 8987.069 | 6841.204 | 8617.204 | 6357.322 | 6654.236 | 8087.211 | 7208.718 | 7019.615 | 8545.876 |
| 427 | 6466.135 | 9015.832 | 7348.032 | 8437.558 | 11657.998 | 8987.069 | 6838.027 | 8617.204 | 6354.479 | 6652.957 | 8087.211 | 7204.531 | 7015.456 | 8545.876 |
| 428 | 6461.657 | 9013.054 | 7345.796 | 8434.969 | 11657.998 | 8987.069 | 6834.86 | 8617.204 | 6351.643 | 6651.679 | 8087.211 | 7200.348 | 7011.307 | 8545.876 |
| 429 | 6457.194 | 9010.277 | 7343.563 | 8429.798 | 11657.998 | 8987.069 | 6831.702 | 8617.204 | 6348.816 | 6650.401 | 8087.211 | 7198.259 | 7007.169 | 8545.876 |
| 430 | 6452.745 | 9007.503 | 7341.333 | 8427.214 | 11657.998 | 8987.069 | 6828.553 | 8617.204 | 6345.997 | 6649.124 | 8087.211 | 7194.084 | 7003.042 | 8545.876 |
| 431 | 6448.31 | 9004.73 | 7339.105 | 8422.052 | 11657.998 | 8987.069 | 6825.413 | 8617.204 | 6343.185 | 6648.166 | 8087.211 | 7191.998 | 6998.925 | 8545.876 |
| 432 | 6443.889 | 9001.959 | 7336.88 | 8419.473 | 11657.998 | 8987.069 | 6822.281 | 8617.204 | 6340.382 | 6646.889 | 8087.211 | 7187.83 | 6994.818 | 8545.876 |
| 433 | 6439.481 | 8999.191 | 7334.658 | 8414.321 | 11657.998 | 8987.069 | 6819.159 | 8617.204 | 6337.586 | 6645.613 | 8087.211 | 7185.747 | 6990.721 | 8545.876 |
| 434 | 6435.088 | 8996.424 | 7332.438 | 8409.174 | 11657.998 | 8987.069 | 6816.046 | 8617.204 | 6334.798 | 6644.497 | 8087.211 | 7181.587 | 6986.635 | 8545.876 |
| 435 | 6430.708 | 8993.659 | 7330.22 | 8406.603 | 11657.998 | 8987.069 | 6812.941 | 8617.204 | 6332.018 | 6643.222 | 8087.211 | 7179.508 | 6982.559 | 8545.876 |
| 436 | 6426.341 | 8990.896 | 7328.006 | 8401.467 | 11657.998 | 8987.069 | 6809.845 | 8617.204 | 6329.246 | 6642.107 | 8087.211 | 7175.354 | 6978.493 | 8545.876 |
| 437 | 6421.988 | 8988.135 | 7325.793 | 8398.9 | 11657.998 | 8987.069 | 6806.758 | 8617.204 | 6326.481 | 6641.151 | 8087.211 | 7173.279 | 6974.437 | 8545.876 |
| 438 | 6417.648 | 8985.376 | 7323.584 | 8396.336 | 11657.998 | 8987.069 | 6803.679 | 8617.204 | 6323.724 | 6639.877 | 8087.211 | 7169.133 | 6970.391 | 8545.876 |
| 439 | 6413.322 | 8982.619 | 7321.377 | 8391.211 | 11657.998 | 8987.069 | 6800.609 | 8617.204 | 6320.975 | 6638.763 | 8087.211 | 7167.062 | 6966.355 | 8545.876 |
| 440 | 6409.009 | 8979.863 | 7319.173 | 8388.652 | 11657.998 | 8987.069 | 6797.548 | 8617.204 | 6318.233 | 6637.649 | 8087.211 | 7162.922 | 6962.329 | 8545.876 |
| 441 | 6404.709 | 8977.11 | 7316.971 | 8383.537 | 11657.998 | 8987.069 | 6794.495 | 8617.204 | 6315.499 | 6636.536 | 8087.211 | 7160.855 | 6958.313 | 8545.876 |
| 442 | 6400.422 | 8974.359 | 7314.772 | 8380.981 | 11657.998 | 8987.069 | 6791.451 | 8617.204 | 6312.772 | 6635.582 | 8087.211 | 7156.722 | 6954.307 | 8545.876 |
| 443 | 6396.148 | 8971.609 | 7312.575 | 8375.876 | 11657.998 | 8987.069 | 6788.415 | 8617.204 | 6310.053 | 6634.469 | 8087.211 | 7154.658 | 6950.311 | 8545.876 |
| 444 | 6391.887 | 8968.861 | 7310.381 | 8373.325 | 11657.998 | 8987.069 | 6785.387 | 8617.204 | 6307.341 | 6633.356 | 8087.211 | 7150.533 | 6946.324 | 8545.876 |
| 445 | 6387.639 | 8966.116 | 7308.189 | 8368.229 | 11657.998 | 8987.069 | 6782.368 | 8617.204 | 6304.637 | 6632.244 | 8087.211 | 7148.473 | 6942.347 | 8545.876 |
| 446 | 6383.404 | 8963.372 | 7306 | 8365.683 | 11657.998 | 8987.069 | 6779.357 | 8617.204 | 6301.94 | 6631.133 | 8087.211 | 7144.355 | 6938.38 | 8545.876 |
| 447 | 6379.181 | 8960.63 | 7303.814 | 8360.596 | 11657.998 | 8987.069 | 6776.354 | 8617.204 | 6299.25 | 6630.18 | 8087.211 | 7142.298 | 6934.422 | 8545.876 |
| 448 | 6374.971 | 8957.89 | 7301.63 | 8358.055 | 11657.998 | 8987.069 | 6773.359 | 8617.204 | 6296.567 | 6629.069 | 8087.211 | 7138.187 | 6930.474 | 8545.876 |
| 449 | 6370.774 | 8955.151 | 7299.449 | 8352.977 | 11657.998 | 8987.069 | 6770.373 | 8617.204 | 6293.892 | 6628.117 | 8087.211 | 7136.133 | 6926.535 | 8545.876 |
| 450 | 6366.589 | 8952.415 | 7297.27 | 8350.44 | 11657.998 | 8987.069 | 6767.395 | 8617.204 | 6291.224 | 6628.117 | 8087.211 | 7132.03 | 6922.606 | 8545.876 |
| 451 | 6362.417 | 8949.681 | 7295.094 | 8345.372 | 11657.998 | 8987.069 | 6764.425 | 8617.204 | 6288.563 | 6628.117 | 8087.211 | 7129.98 | 6918.686 | 8545.876 |
| 452 | 6358.257 | 8946.948 | 7292.92 | 8342.84 | 11657.998 | 8987.069 | 6761.462 | 8617.204 | 6285.909 | 6628.117 | 8087.211 | 7125.883 | 6914.775 | 8545.876 |
| 453 | 6354.11 | 8944.218 | 7290.749 | 8337.78 | 11657.998 | 8987.069 | 6758.508 | 8617.204 | 6283.262 | 6628.117 | 8087.211 | 7123.837 | 6910.874 | 8545.876 |
| 454 | 6349.974 | 8941.489 | 7288.581 | 8335.253 | 11657.998 | 8987.069 | 6755.562 | 8617.204 | 6280.622 | 6628.117 | 8087.211 | 7121.792 | 6906.982 | 8545.876 |
| 455 | 6345.851 | 8938.762 | 7286.415 | 8332.727 | 11657.998 | 8987.069 | 6752.624 | 8617.204 | 6277.99 | 6628.117 | 8087.211 | 7117.704 | 6903.1 | 8545.876 |
| 456 | 6341.74 | 8936.037 | 7284.251 | 8327.68 | 11657.998 | 8987.069 | 6749.693 | 8617.204 | 6275.364 | 6628.117 | 8087.211 | 7115.663 | 6899.226 | 8545.876 |
| 457 | 6337.641 | 8933.314 | 7282.09 | 8325.159 | 11657.998 | 8987.069 | 6746.771 | 8617.204 | 6272.745 | 6628.117 | 8087.211 | 7111.583 | 6895.362 | 8545.876 |
| 458 | 6333.554 | 8930.592 | 7279.932 | 8320.121 | 11657.998 | 8987.069 | 6743.856 | 8617.204 | 6270.133 | 6628.117 | 8087.211 | 7109.544 | 6891.506 | 8545.876 |
| 459 | 6329.479 | 8927.873 | 7277.776 | 8317.604 | 11657.998 | 8987.069 | 6740.949 | 8617.204 | 6267.528 | 6628.117 | 8087.211 | 7105.471 | 6887.66 | 8545.876 |
| 460 | 6325.416 | 8925.155 | 7275.622 | 8312.576 | 11657.998 | 8987.069 | 6738.05 | 8617.204 | 6264.93 | 6628.117 | 8087.211 | 7103.436 | 6883.823 | 8545.876 |
| 461 | 6321.364 | 8922.439 | 7273.472 | 8310.063 | 11657.998 | 8987.069 | 6735.158 | 8617.204 | 6262.338 | 6628.117 | 8087.211 | 7099.37 | 6879.995 | 8545.876 |
| 462 | 6317.324 | 8919.725 | 7271.323 | 8305.044 | 11657.998 | 8987.069 | 6732.274 | 8617.204 | 6259.754 | 6628.117 | 8087.211 | 7097.339 | 6876.175 | 8545.876 |
| 463 | 6313.296 | 8917.013 | 7269.177 | 8302.536 | 11657.998 | 8987.069 | 6729.398 | 8617.204 | 6257.176 | 6628.117 | 8087.211 | 7093.28 | 6872.365 | 8545.876 |
| 464 | 6309.28 | 8914.303 | 7267.034 | 8300.03 | 11657.998 | 8987.069 | 6726.529 | 8617.204 | 6254.604 | 6628.117 | 8087.211 | 7091.252 | 6868.563 | 8545.876 |
| 465 | 6305.275 | 8911.595 | 7264.893 | 8295.023 | 11657.998 | 8987.069 | 6723.667 | 8617.204 | 6252.04 | 6628.117 | 8087.211 | 7089.225 | 6864.77 | 8545.876 |
| 466 | 6301.281 | 8908.888 | 7262.755 | 8292.521 | 11657.998 | 8987.069 | 6720.814 | 8617.204 | 6249.482 | 6628.117 | 8087.211 | 7085.176 | 6860.986 | 8545.876 |
| 467 | 6297.299 | 8906.184 | 7260.619 | 8287.523 | 11657.998 | 8987.069 | 6717.967 | 8617.204 | 6246.93 | 6628.117 | 8087.211 | 7083.152 | 6857.211 | 8545.876 |
| 468 | 6293.328 | 8903.481 | 7258.485 | 8285.026 | 11657.998 | 8987.069 | 6715.128 | 8617.204 | 6244.386 | 6628.117 | 8087.211 | 7079.11 | 6853.444 | 8545.876 |
| 469 | 6289.369 | 8900.78 | 7256.354 | 8282.53 | 11657.998 | 8987.069 | 6712.297 | 8617.204 | 6241.847 | 6628.117 | 8087.211 | 7077.09 | 6849.686 | 8545.876 |
| 470 | 6285.421 | 8898.081 | 7254.226 | 8277.544 | 11657.998 | 8987.069 | 6709.472 | 8617.204 | 6239.316 | 6628.117 | 8087.211 | 7073.054 | 6845.936 | 8545.876 |
| 471 | 6281.483 | 8895.383 | 7252.1 | 8275.053 | 11657.998 | 8987.069 | 6706.655 | 8617.204 | 6236.79 | 6628.117 | 8087.211 | 7071.038 | 6842.195 | 8545.876 |
| 472 | 6277.558 | 8892.688 | 7249.977 | 8270.075 | 11657.998 | 8987.069 | 6703.845 | 8617.204 | 6234.271 | 6628.117 | 8087.211 | 7069.023 | 6838.463 | 8545.876 |
| 473 | 6273.643 | 8889.994 | 7247.856 | 8267.589 | 11657.998 | 8987.069 | 6701.043 | 8617.204 | 6231.759 | 6628.117 | 8087.211 | 7064.996 | 6834.739 | 8545.876 |
| 474 | 6269.739 | 8887.302 | 7245.737 | 8265.104 | 11657.998 | 8987.069 | 6698.248 | 8617.204 | 6229.253 | 6628.117 | 8087.211 | 7062.984 | 6831.023 | 8545.876 |
| 475 | 6265.846 | 8884.612 | 7243.621 | 8260.138 | 11657.998 | 8987.069 | 6695.459 | 8617.204 | 6226.753 | 6628.117 | 8087.211 | 7058.964 | 6827.316 | 8545.876 |
| 476 | 6261.964 | 8881.924 | 7241.507 | 8257.658 | 11657.998 | 8987.069 | 6692.678 | 8617.204 | 6224.259 | 6628.117 | 8087.211 | 7056.956 | 6823.617 | 8545.876 |
| 477 | 6258.092 | 8879.237 | 7239.396 | 8252.701 | 11657.998 | 8987.069 | 6689.904 | 8617.204 | 6221.772 | 6628.117 | 8087.211 | 7054.949 | 6819.926 | 8545.876 |
| 478 | 6254.232 | 8876.553 | 7237.288 | 8250.225 | 11657.998 | 8987.069 | 6687.137 | 8617.204 | 6219.291 | 6628.117 | 8087.211 | 7050.938 | 6816.244 | 8545.876 |
| 479 | 6250.382 | 8873.87 | 7235.181 | 8247.75 | 11657.998 | 8987.069 | 6684.377 | 8617.204 | 6216.816 | 6628.117 | 8087.211 | 7048.934 | 6812.57 | 8545.876 |
| 480 | 6246.543 | 8871.189 | 7233.078 | 8242.806 | 11657.998 | 8987.069 | 6681.625 | 8617.204 | 6214.348 | 6628.117 | 8087.211 | 7044.93 | 6808.904 | 8545.876 |
| 481 | 6242.714 | 8868.509 | 7230.976 | 8240.336 | 11657.998 | 8987.069 | 6678.879 | 8617.204 | 6211.885 | 6628.117 | 8087.211 | 7042.93 | 6805.246 | 8545.876 |
| 482 | 6238.896 | 8865.832 | 7228.877 | 8235.4 | 11657.998 | 8987.069 | 6676.139 | 8617.204 | 6209.429 | 6628.117 | 8087.211 | 7040.931 | 6801.597 | 8545.876 |
| 483 | 6235.089 | 8863.156 | 7226.781 | 8232.934 | 11657.998 | 8987.069 | 6673.407 | 8617.204 | 6206.979 | 6628.117 | 8087.211 | 7036.936 | 6797.955 | 8545.876 |
| 484 | 6231.292 | 8860.482 | 7224.687 | 8230.47 | 11657.998 | 8987.069 | 6670.682 | 8617.204 | 6204.535 | 6628.117 | 8087.211 | 7034.94 | 6794.322 | 8545.876 |
| 485 | 6227.505 | 8857.81 | 7222.595 | 8225.546 | 11657.998 | 8987.069 | 6667.963 | 8617.204 | 6202.097 | 6628.117 | 8087.211 | 7030.952 | 6790.696 | 8545.876 |
| 486 | 6223.729 | 8855.14 | 7220.506 | 8223.086 | 11657.998 | 8987.069 | 6665.252 | 8617.204 | 6199.665 | 6628.117 | 8087.211 | 7028.96 | 6787.079 | 8545.876 |
| 487 | 6219.963 | 8852.472 | 7218.42 | 8220.628 | 11657.998 | 8987.069 | 6662.547 | 8617.204 | 6197.239 | 6628.117 | 8087.211 | 7026.969 | 6783.469 | 8545.876 |
| 488 | 6216.207 | 8849.805 | 7216.335 | 8215.716 | 11657.998 | 8987.069 | 6659.848 | 8617.204 | 6194.819 | 6628.117 | 8087.211 | 7022.99 | 6779.867 | 8545.876 |
| 489 | 6212.461 | 8847.14 | 7214.253 | 8213.262 | 11657.998 | 8987.069 | 6657.157 | 8617.204 | 6192.404 | 6628.117 | 8087.211 | 7021.002 | 6776.274 | 8545.876 |
| 490 | 6208.725 | 8844.477 | 7212.174 | 8208.358 | 11657.998 | 8987.069 | 6654.472 | 8617.204 | 6189.996 | 6628.117 | 8087.211 | 7019.015 | 6772.688 | 8545.876 |
| 491 | 6205 | 8841.815 | 7210.097 | 8205.909 | 11657.998 | 8987.069 | 6651.793 | 8617.204 | 6187.594 | 6628.117 | 8087.211 | 7015.045 | 6769.109 | 8545.876 |
| 492 | 6201.285 | 8839.156 | 7208.022 | 8203.461 | 11657.998 | 8987.069 | 6649.122 | 8617.204 | 6185.197 | 6628.117 | 8087.211 | 7013.062 | 6765.539 | 8545.876 |
| 493 | 6197.579 | 8836.498 | 7205.95 | 8198.569 | 11657.998 | 8987.069 | 6646.456 | 8617.204 | 6182.806 | 6628.117 | 8087.211 | 7009.099 | 6761.976 | 8545.876 |
| 494 | 6193.883 | 8833.842 | 7203.88 | 8196.125 | 11657.998 | 8987.069 | 6643.798 | 8617.204 | 6180.421 | 6628.117 | 8087.211 | 7007.119 | 6758.421 | 8545.876 |
| 495 | 6190.198 | 8831.188 | 7201.813 | 8193.683 | 11657.998 | 8987.069 | 6641.145 | 8617.204 | 6178.042 | 6628.117 | 8087.211 | 7005.14 | 6754.874 | 8545.876 |
| 496 | 6186.522 | 8828.535 | 7199.748 | 8188.803 | 11657.998 | 8987.069 | 6638.5 | 8617.204 | 6175.668 | 6628.117 | 8087.211 | 7001.185 | 6751.334 | 8545.876 |
| 497 | 6182.856 | 8825.884 | 7197.685 | 8186.365 | 11657.998 | 8987.069 | 6635.86 | 8617.204 | 6173.301 | 6628.117 | 8087.211 | 6999.21 | 6747.802 | 8545.876 |
| 498 | 6179.199 | 8823.235 | 7195.625 | 8183.929 | 11657.998 | 8987.069 | 6633.228 | 8617.204 | 6170.938 | 6628.117 | 8087.211 | 6997.236 | 6744.277 | 8545.876 |
| 499 | 6175.553 | 8820.588 | 7193.567 | 8179.06 | 11657.998 | 8987.069 | 6630.601 | 8617.204 | 6168.582 | 6628.117 | 8087.211 | 6993.29 | 6740.76 | 8545.876 |
| 500 | 6173.542 | 8817.943 | 7191.512 | 8176.628 | 11657.998 | 8987.069 | 6627.981 | 8617.204 | 6166.231 | 6628.117 | 8087.211 | 6991.319 | 6737.25 | 8545.876 |
| 501 | 6173.542 | 8815.299 | 7189.459 | 8174.197 | 11657.998 | 8987.069 | 6625.367 | 8617.204 | 6163.886 | 6628.117 | 8087.211 | 6989.349 | 6733.748 | 8545.876 |
| 502 | 6173.542 | 8812.657 | 7187.408 | 8169.34 | 11657.998 | 8987.069 | 6622.759 | 8617.204 | 6161.546 | 6628.117 | 8087.211 | 6985.413 | 6730.253 | 8545.876 |
| 503 | 6173.542 | 8810.017 | 7185.36 | 8166.914 | 11657.998 | 8987.069 | 6620.158 | 8617.204 | 6159.212 | 6628.117 | 8087.211 | 6983.446 | 6726.766 | 8545.876 |
| 504 | 6173.542 | 8807.378 | 7183.314 | 8164.489 | 11657.998 | 8987.069 | 6617.563 | 8617.204 | 6156.883 | 6628.117 | 8087.211 | 6979.516 | 6723.286 | 8545.876 |
| 505 | 6173.542 | 8804.741 | 7181.27 | 8159.644 | 11657.998 | 8987.069 | 6614.974 | 8617.204 | 6154.56 | 6628.117 | 8087.211 | 6977.553 | 6719.813 | 8545.876 |
| 506 | 6173.542 | 8802.106 | 7179.229 | 8157.223 | 11657.998 | 8987.069 | 6612.391 | 8617.204 | 6152.242 | 6628.117 | 8087.211 | 6975.591 | 6716.348 | 8545.876 |
| 507 | 6173.542 | 8799.473 | 7177.191 | 8154.804 | 11657.998 | 8987.069 | 6609.815 | 8617.204 | 6149.93 | 6628.117 | 8087.211 | 6971.669 | 6712.89 | 8545.876 |
| 508 | 6173.542 | 8796.842 | 7175.154 | 8149.97 | 11657.998 | 8987.069 | 6607.244 | 8617.204 | 6147.623 | 6628.117 | 8087.211 | 6969.711 | 6709.439 | 8545.876 |
| 509 | 6173.542 | 8794.212 | 7173.12 | 8147.556 | 11657.998 | 8987.069 | 6604.68 | 8617.204 | 6145.322 | 6628.117 | 8087.211 | 6967.753 | 6705.995 | 8545.876 |
| 510 | 6173.542 | 8791.584 | 7171.088 | 8145.142 | 11657.998 | 8987.069 | 6602.122 | 8617.204 | 6143.026 | 6628.117 | 8087.211 | 6963.841 | 6702.559 | 8545.876 |
| 511 | 6173.542 | 8788.957 | 7169.059 | 8140.32 | 11657.998 | 8987.069 | 6599.569 | 8617.204 | 6140.735 | 6628.117 | 8087.211 | 6961.886 | 6699.129 | 8545.876 |
| 512 | 6173.542 | 8786.333 | 7167.032 | 8137.911 | 11657.998 | 8987.069 | 6597.023 | 8617.204 | 6138.45 | 6628.117 | 8087.211 | 6959.933 | 6695.707 | 8545.876 |
| 513 | 6173.542 | 8783.71 | 7165.007 | 8135.503 | 11657.998 | 8987.069 | 6594.483 | 8617.204 | 6136.17 | 6628.117 | 8087.211 | 6956.029 | 6692.292 | 8545.876 |
| 514 | 6173.542 | 8781.089 | 7162.985 | 8130.692 | 11657.998 | 8987.069 | 6591.948 | 8617.204 | 6133.895 | 6628.117 | 8087.211 | 6954.079 | 6688.883 | 8545.876 |
| 515 | 6173.542 | 8778.469 | 7160.965 | 8128.289 | 11657.998 | 8987.069 | 6589.42 | 8617.204 | 6131.626 | 6628.117 | 8087.211 | 6952.13 | 6685.482 | 8545.876 |
| 516 | 6173.542 | 8775.851 | 7158.947 | 8125.887 | 11657.998 | 8987.069 | 6586.897 | 8617.204 | 6129.361 | 6628.117 | 8087.211 | 6950.182 | 6682.088 | 8545.876 |
| 517 | 6173.542 | 8773.235 | 7156.932 | 8123.486 | 11657.998 | 8987.069 | 6584.381 | 8617.204 | 6127.102 | 6628.117 | 8087.211 | 6946.29 | 6678.701 | 8545.876 |
| 518 | 6173.542 | 8770.621 | 7154.919 | 8118.689 | 11657.998 | 8987.069 | 6581.87 | 8617.204 | 6124.848 | 6628.117 | 8087.211 | 6944.345 | 6675.32 | 8545.876 |
| 519 | 6173.542 | 8768.008 | 7152.908 | 8116.293 | 11657.998 | 8987.069 | 6579.365 | 8617.204 | 6122.6 | 6628.117 | 8087.211 | 6942.401 | 6671.947 | 8545.876 |
| 520 | 6173.542 | 8765.397 | 7150.9 | 8113.898 | 11657.998 | 8987.069 | 6576.865 | 8617.204 | 6120.356 | 6628.117 | 8087.211 | 6938.517 | 6668.58 | 8545.876 |
| 521 | 6173.542 | 8762.788 | 7148.894 | 8109.112 | 11657.998 | 8987.069 | 6574.372 | 8617.204 | 6118.118 | 6628.117 | 8087.211 | 6936.577 | 6665.221 | 8545.876 |
| 522 | 6173.542 | 8760.181 | 7146.891 | 8106.722 | 11657.998 | 8987.069 | 6571.884 | 8617.204 | 6115.884 | 6628.117 | 8087.211 | 6934.638 | 6661.868 | 8545.876 |
| 523 | 6173.542 | 8757.575 | 7144.889 | 8104.332 | 11657.998 | 8987.069 | 6569.402 | 8617.204 | 6113.656 | 6628.117 | 8087.211 | 6930.763 | 6658.522 | 8545.876 |
| 524 | 6173.542 | 8754.971 | 7142.89 | 8101.945 | 11657.998 | 8987.069 | 6566.926 | 8617.204 | 6111.433 | 6628.117 | 8087.211 | 6928.827 | 6655.182 | 8545.876 |
| 525 | 6173.542 | 8752.368 | 7140.893 | 8097.173 | 11657.998 | 8987.069 | 6564.455 | 8617.204 | 6109.214 | 6628.117 | 8087.211 | 6926.892 | 6651.85 | 8545.876 |
| 526 | 6173.542 | 8749.768 | 7138.899 | 8094.79 | 11657.998 | 8987.069 | 6561.99 | 8617.204 | 6107.001 | 6628.117 | 8087.211 | 6923.025 | 6648.524 | 8545.876 |
| 527 | 6173.542 | 8747.169 | 7136.907 | 8092.407 | 11657.998 | 8987.069 | 6559.53 | 8617.204 | 6104.793 | 6628.117 | 8087.211 | 6921.094 | 6645.205 | 8545.876 |
| 528 | 6173.542 | 8744.571 | 7134.917 | 8087.647 | 11657.998 | 8987.069 | 6557.077 | 8617.204 | 6102.589 | 6628.117 | 8087.211 | 6919.163 | 6641.892 | 8545.876 |
| 529 | 6173.542 | 8741.976 | 7132.93 | 8085.269 | 11657.998 | 8987.069 | 6554.628 | 8617.204 | 6100.391 | 6628.117 | 8087.211 | 6917.234 | 6638.586 | 8545.876 |
| 530 | 6173.542 | 8739.382 | 7130.944 | 8082.892 | 11657.998 | 8987.069 | 6552.186 | 8617.204 | 6098.198 | 6628.117 | 8087.211 | 6913.378 | 6635.286 | 8545.876 |
| 531 | 6173.542 | 8736.79 | 7128.962 | 8080.517 | 11657.998 | 8987.069 | 6549.748 | 8617.204 | 6096.009 | 6628.117 | 8087.211 | 6911.452 | 6631.994 | 8545.876 |
| 532 | 6173.542 | 8734.199 | 7126.981 | 8075.771 | 11657.998 | 8987.069 | 6547.316 | 8617.204 | 6093.825 | 6628.117 | 8087.211 | 6909.526 | 6628.707 | 8545.876 |
| 533 | 6173.542 | 8731.61 | 7125.003 | 8073.4 | 11657.998 | 8987.069 | 6544.89 | 8617.204 | 6091.646 | 6628.117 | 8087.211 | 6905.679 | 6625.427 | 8545.876 |
| 534 | 6173.542 | 8729.023 | 7123.027 | 8071.03 | 11657.998 | 8987.069 | 6542.469 | 8617.204 | 6089.472 | 6628.117 | 8087.211 | 6903.757 | 6622.154 | 8545.876 |
| 535 | 6173.542 | 8726.437 | 7121.053 | 8066.295 | 11657.998 | 8987.069 | 6540.054 | 8617.204 | 6087.303 | 6628.117 | 8087.211 | 6901.836 | 6618.887 | 8545.876 |
| 536 | 6173.542 | 8723.853 | 7119.081 | 8063.93 | 11657.998 | 8987.069 | 6537.644 | 8617.204 | 6085.139 | 6628.117 | 8087.211 | 6899.917 | 6615.627 | 8545.876 |
| 537 | 6173.542 | 8721.271 | 7117.112 | 8061.566 | 11657.998 | 8987.069 | 6535.239 | 8617.204 | 6082.979 | 6628.117 | 8087.211 | 6896.08 | 6612.373 | 8545.876 |
| 538 | 6173.542 | 8718.691 | 7115.145 | 8059.203 | 11657.998 | 8987.069 | 6532.84 | 8617.204 | 6080.824 | 6628.117 | 8087.211 | 6894.163 | 6609.125 | 8545.876 |
| 539 | 6173.542 | 8716.112 | 7113.181 | 8054.482 | 11657.998 | 8987.069 | 6530.446 | 8617.204 | 6078.674 | 6628.117 | 8087.211 | 6892.248 | 6605.883 | 8545.876 |
| 540 | 6173.542 | 8713.535 | 7111.218 | 8052.123 | 11657.998 | 8987.069 | 6528.057 | 8617.204 | 6076.528 | 6628.117 | 8087.211 | 6890.333 | 6602.648 | 8545.876 |
| 541 | 6173.542 | 8710.959 | 7109.258 | 8049.766 | 11657.998 | 8987.069 | 6525.674 | 8617.204 | 6074.387 | 6628.117 | 8087.211 | 6886.507 | 6599.42 | 8545.876 |
| 542 | 6173.542 | 8708.385 | 7107.3 | 8047.41 | 11657.998 | 8987.069 | 6523.295 | 8617.204 | 6072.251 | 6628.117 | 8087.211 | 6884.596 | 6596.197 | 8545.876 |
| 543 | 6173.542 | 8705.813 | 7105.345 | 8042.703 | 11657.998 | 8987.069 | 6520.922 | 8617.204 | 6070.12 | 6628.117 | 8087.211 | 6882.686 | 6592.981 | 8545.876 |
| 544 | 6173.542 | 8703.242 | 7103.391 | 8040.351 | 11657.998 | 8987.069 | 6518.555 | 8617.204 | 6067.993 | 6628.117 | 8087.211 | 6878.869 | 6589.771 | 8545.876 |
| 545 | 6173.542 | 8700.673 | 7101.44 | 8038.001 | 11657.998 | 8987.069 | 6516.192 | 8617.204 | 6065.871 | 6628.117 | 8087.211 | 6876.961 | 6586.567 | 8545.876 |
| 546 | 6173.542 | 8698.106 | 7099.492 | 8035.652 | 11657.998 | 8987.069 | 6513.835 | 8617.204 | 6063.753 | 6628.117 | 8087.211 | 6875.055 | 6583.37 | 8545.876 |
| 547 | 6173.542 | 8695.54 | 7097.545 | 8030.958 | 11657.998 | 8987.069 | 6511.483 | 8617.204 | 6061.64 | 6628.117 | 8087.211 | 6873.15 | 6580.178 | 8545.876 |
| 548 | 6173.542 | 8692.976 | 7095.601 | 8028.613 | 11657.998 | 8987.069 | 6509.135 | 8617.204 | 6059.531 | 6628.117 | 8087.211 | 6869.344 | 6576.993 | 8545.876 |
| 549 | 6173.542 | 8690.414 | 7093.659 | 8026.27 | 11657.998 | 8987.069 | 6506.793 | 8617.204 | 6057.427 | 6628.117 | 8087.211 | 6867.442 | 6573.813 | 8545.876 |
| 550 | 6173.542 | 8687.853 | 7091.719 | 8023.928 | 11657.998 | 8987.069 | 6504.456 | 8617.204 | 6055.328 | 6628.117 | 8087.211 | 6865.541 | 6570.64 | 8545.876 |
| 551 | 6173.542 | 8685.294 | 7089.781 | 8019.248 | 11657.998 | 8987.069 | 6502.125 | 8617.204 | 6053.233 | 6628.117 | 8087.211 | 6863.641 | 6567.473 | 8545.876 |
| 552 | 6173.542 | 8682.737 | 7087.846 | 8016.91 | 11657.998 | 8987.069 | 6499.798 | 8617.204 | 6051.142 | 6628.117 | 8087.211 | 6859.845 | 6564.312 | 8545.876 |
| 553 | 6173.542 | 8680.181 | 7085.913 | 8014.573 | 11657.998 | 8987.069 | 6497.476 | 8617.204 | 6049.056 | 6628.117 | 8087.211 | 6857.949 | 6561.157 | 8545.876 |
| 554 | 6173.542 | 8677.627 | 7083.982 | 8012.238 | 11657.998 | 8987.069 | 6495.159 | 8617.204 | 6046.974 | 6628.117 | 8087.211 | 6856.053 | 6558.008 | 8545.876 |
| 555 | 6173.542 | 8675.075 | 7082.053 | 8007.571 | 11657.998 | 8987.069 | 6492.847 | 8617.204 | 6044.897 | 6628.117 | 8087.211 | 6854.159 | 6554.865 | 8545.876 |
| 556 | 6173.542 | 8672.524 | 7080.127 | 8005.24 | 11657.998 | 8987.069 | 6490.54 | 8617.204 | 6042.824 | 6628.117 | 8087.211 | 6850.373 | 6551.727 | 8545.876 |
| 557 | 6173.542 | 8669.974 | 7078.202 | 8002.91 | 11657.998 | 8987.069 | 6488.238 | 8617.204 | 6040.756 | 6628.117 | 8087.211 | 6848.482 | 6548.596 | 8545.876 |
| 558 | 6173.542 | 8667.427 | 7076.28 | 8000.582 | 11657.998 | 8987.069 | 6485.941 | 8617.204 | 6038.692 | 6628.117 | 8087.211 | 6846.591 | 6545.471 | 8545.876 |
| 559 | 6173.542 | 8664.881 | 7074.361 | 7998.255 | 11657.998 | 8987.069 | 6483.649 | 8617.204 | 6036.632 | 6628.117 | 8087.211 | 6844.702 | 6542.351 | 8545.876 |
| 560 | 6173.542 | 8662.336 | 7072.443 | 7993.605 | 11657.998 | 8987.069 | 6481.362 | 8617.204 | 6034.576 | 6628.117 | 8087.211 | 6840.927 | 6539.237 | 8545.876 |
| 561 | 6173.542 | 8659.794 | 7070.528 | 7991.282 | 11657.998 | 8987.069 | 6479.079 | 8617.204 | 6032.525 | 6628.117 | 8087.211 | 6839.041 | 6536.129 | 8545.876 |
| 562 | 6173.542 | 8657.253 | 7068.614 | 7988.96 | 11657.998 | 8987.069 | 6476.802 | 8617.204 | 6030.478 | 6628.117 | 8087.211 | 6837.155 | 6533.027 | 8545.876 |
| 563 | 6173.542 | 8654.713 | 7066.703 | 7986.64 | 11657.998 | 8987.069 | 6474.529 | 8617.204 | 6028.436 | 6628.117 | 8087.211 | 6835.271 | 6529.931 | 8545.876 |
| 564 | 6173.542 | 8652.175 | 7064.795 | 7982.003 | 11657.998 | 8987.069 | 6472.261 | 8617.204 | 6026.397 | 6628.117 | 8087.211 | 6833.388 | 6526.84 | 8545.876 |
| 565 | 6173.542 | 8649.639 | 7062.888 | 7979.687 | 11657.998 | 8987.069 | 6469.998 | 8617.204 | 6024.363 | 6628.117 | 8087.211 | 6829.626 | 6523.755 | 8545.876 |
| 566 | 6173.542 | 8647.104 | 7060.984 | 7977.372 | 11657.998 | 8987.069 | 6467.739 | 8617.204 | 6022.333 | 6628.117 | 8087.211 | 6827.746 | 6520.676 | 8545.876 |
| 567 | 6173.542 | 8644.571 | 7059.082 | 7975.058 | 11657.998 | 8987.069 | 6465.485 | 8617.204 | 6020.308 | 6628.117 | 8087.211 | 6825.867 | 6517.603 | 8545.876 |
| 568 | 6173.542 | 8642.04 | 7057.182 | 7972.746 | 11657.998 | 8987.069 | 6463.236 | 8617.204 | 6018.286 | 6628.117 | 8087.211 | 6823.989 | 6514.535 | 8545.876 |
| 569 | 6173.542 | 8639.51 | 7055.284 | 7968.125 | 11657.998 | 8987.069 | 6460.992 | 8617.204 | 6016.269 | 6628.117 | 8087.211 | 6820.236 | 6511.473 | 8545.876 |
| 570 | 6173.542 | 8636.982 | 7053.388 | 7965.817 | 11657.998 | 8987.069 | 6458.752 | 8617.204 | 6014.256 | 6628.117 | 8087.211 | 6818.362 | 6508.416 | 8545.876 |
| 571 | 6173.542 | 8634.455 | 7051.495 | 7963.51 | 11657.998 | 8987.069 | 6456.517 | 8617.204 | 6012.247 | 6628.117 | 8087.211 | 6816.488 | 6505.365 | 8545.876 |
| 572 | 6173.542 | 8631.93 | 7049.603 | 7961.204 | 11657.998 | 8987.069 | 6454.287 | 8617.204 | 6010.242 | 6628.117 | 8087.211 | 6814.615 | 6502.32 | 8545.876 |
| 573 | 6173.542 | 8629.406 | 7047.714 | 7958.9 | 11657.998 | 8987.069 | 6452.061 | 8617.204 | 6008.241 | 6628.117 | 8087.211 | 6812.744 | 6499.28 | 8545.876 |
| 574 | 6173.542 | 8626.885 | 7045.828 | 7954.296 | 11657.998 | 8987.069 | 6449.84 | 8617.204 | 6006.244 | 6628.117 | 8087.211 | 6809.004 | 6496.246 | 8545.876 |
| 575 | 6173.542 | 8624.364 | 7043.943 | 7951.995 | 11657.998 | 8987.069 | 6447.623 | 8617.204 | 6004.252 | 6628.117 | 8087.211 | 6807.135 | 6493.217 | 8545.876 |
| 576 | 6173.542 | 8621.846 | 7042.06 | 7949.696 | 11657.998 | 8987.069 | 6445.411 | 8617.204 | 6002.263 | 6628.117 | 8087.211 | 6805.267 | 6490.194 | 8545.876 |
| 577 | 6173.542 | 8619.329 | 7040.18 | 7947.399 | 11657.998 | 8987.069 | 6443.204 | 8617.204 | 6000.279 | 6628.117 | 8087.211 | 6803.401 | 6487.176 | 8545.876 |
| 578 | 6173.542 | 8616.813 | 7038.302 | 7945.103 | 11657.998 | 8987.069 | 6441.001 | 8617.204 | 5998.298 | 6628.117 | 8087.211 | 6801.536 | 6484.163 | 8545.876 |
| 579 | 6173.542 | 8614.299 | 7036.426 | 7940.514 | 11657.998 | 8987.069 | 6438.802 | 8617.204 | 5996.322 | 6628.117 | 8087.211 | 6797.808 | 6481.156 | 8545.876 |
| 580 | 6173.542 | 8611.787 | 7034.552 | 7938.222 | 11657.998 | 8987.069 | 6436.608 | 8617.204 | 5994.349 | 6628.117 | 8087.211 | 6795.945 | 6478.155 | 8545.876 |
| 581 | 6173.542 | 8609.276 | 7032.68 | 7935.931 | 11657.998 | 8987.069 | 6434.419 | 8617.204 | 5992.381 | 6628.117 | 8087.211 | 6794.084 | 6475.159 | 8545.876 |
| 582 | 6173.542 | 8606.767 | 7030.81 | 7933.641 | 11657.998 | 8987.069 | 6432.234 | 8617.204 | 5990.416 | 6628.117 | 8087.211 | 6792.223 | 6472.168 | 8545.876 |
| 583 | 6173.542 | 8604.259 | 7028.943 | 7931.353 | 11657.998 | 8987.069 | 6430.053 | 8617.204 | 5988.455 | 6628.117 | 8087.211 | 6790.364 | 6469.183 | 8545.876 |
| 584 | 6173.542 | 8601.753 | 7027.078 | 7929.066 | 11657.998 | 8987.069 | 6427.877 | 8617.204 | 5986.499 | 6628.117 | 8087.211 | 6786.648 | 6466.203 | 8545.876 |
| 585 | 6173.542 | 8599.249 | 7025.214 | 7924.496 | 11657.998 | 8987.069 | 6425.705 | 8617.204 | 5984.546 | 6628.117 | 8087.211 | 6784.792 | 6463.228 | 8545.876 |
| 586 | 6173.542 | 8596.746 | 7023.353 | 7922.213 | 11657.998 | 8987.069 | 6423.537 | 8617.204 | 5982.597 | 6628.117 | 8087.211 | 6782.937 | 6460.258 | 8545.876 |
| 587 | 6173.542 | 8594.245 | 7021.495 | 7919.931 | 11657.998 | 8987.069 | 6421.374 | 8617.204 | 5980.652 | 6628.117 | 8087.211 | 6781.083 | 6457.294 | 8545.876 |
| 588 | 6173.542 | 8591.745 | 7019.638 | 7917.65 | 11657.998 | 8987.069 | 6419.216 | 8617.204 | 5978.711 | 6628.117 | 8087.211 | 6779.229 | 6454.335 | 8545.876 |
| 589 | 6173.542 | 8589.247 | 7017.783 | 7915.371 | 11657.998 | 8987.069 | 6417.061 | 8617.204 | 5976.773 | 6628.117 | 8087.211 | 6775.526 | 6451.382 | 8545.876 |
| 590 | 6173.542 | 8586.75 | 7015.931 | 7910.817 | 11657.998 | 8987.069 | 6414.911 | 8617.204 | 5974.84 | 6628.117 | 8087.211 | 6773.676 | 6448.433 | 8545.876 |
| 591 | 6173.542 | 8584.255 | 7014.08 | 7908.542 | 11657.998 | 8987.069 | 6412.766 | 8617.204 | 5972.91 | 6628.117 | 8087.211 | 6771.826 | 6445.49 | 8545.876 |
| 592 | 6173.542 | 8581.762 | 7012.232 | 7906.268 | 11657.998 | 8987.069 | 6410.624 | 8617.204 | 5970.984 | 6628.117 | 8087.211 | 6769.978 | 6442.552 | 8545.876 |
| 593 | 6173.542 | 8579.27 | 7010.386 | 7903.995 | 11657.998 | 8987.069 | 6408.487 | 8617.204 | 5969.062 | 6628.117 | 8087.211 | 6768.131 | 6439.619 | 8545.876 |
| 594 | 6173.542 | 8576.78 | 7008.542 | 7901.724 | 11657.998 | 8987.069 | 6406.354 | 8617.204 | 5967.144 | 6628.117 | 8087.211 | 6766.285 | 6436.691 | 8545.876 |
| 595 | 6173.542 | 8574.291 | 7006.7 | 7899.454 | 11657.998 | 8987.069 | 6404.225 | 8617.204 | 5965.229 | 6628.117 | 8087.211 | 6762.595 | 6433.768 | 8545.876 |
| 596 | 6173.542 | 8571.804 | 7004.861 | 7894.918 | 11657.998 | 8987.069 | 6402.101 | 8617.204 | 5963.318 | 6628.117 | 8087.211 | 6760.752 | 6430.851 | 8545.876 |
| 597 | 6173.542 | 8569.318 | 7003.023 | 7892.652 | 11657.998 | 8987.069 | 6399.98 | 8617.204 | 5961.411 | 6628.117 | 8087.211 | 6758.91 | 6427.938 | 8545.876 |
| 598 | 6173.542 | 8566.834 | 7001.188 | 7890.387 | 11657.998 | 8987.069 | 6397.864 | 8617.204 | 5959.508 | 6628.117 | 8087.211 | 6757.069 | 6425.031 | 8545.876 |
| 599 | 6173.542 | 8564.351 | 6999.354 | 7888.124 | 11657.998 | 8987.069 | 6395.752 | 8617.204 | 5957.608 | 6628.117 | 8087.211 | 6755.229 | 6422.128 | 8545.876 |
| 600 | 6173.542 | 8561.87 | 6997.523 | 7885.862 | 11657.998 | 8987.069 | 6395.752 | 8617.204 | 5955.712 | 6628.117 | 8087.211 | 6751.551 | 6419.231 | 8545.876 |
| 601 | 6173.542 | 8559.391 | 6995.694 | 7883.601 | 11657.998 | 8987.069 | 6395.752 | 8617.204 | 5953.82 | 6628.117 | 8087.211 | 6749.714 | 6416.338 | 8545.876 |
| 602 | 6173.542 | 8556.913 | 6993.867 | 7881.341 | 11657.998 | 8987.069 | 6395.752 | 8617.204 | 5951.932 | 6628.117 | 8087.211 | 6747.878 | 6413.451 | 8545.876 |
| 603 | 6173.542 | 8554.436 | 6992.042 | 7876.826 | 11657.998 | 8987.069 | 6395.752 | 8617.204 | 5950.047 | 6628.117 | 8087.211 | 6746.043 | 6410.569 | 8545.876 |
| 604 | 6173.542 | 8551.962 | 6990.219 | 7874.57 | 11657.998 | 8987.069 | 6395.752 | 8617.204 | 5948.165 | 6628.117 | 8087.211 | 6744.209 | 6407.691 | 8545.876 |
| 605 | 6173.542 | 8549.488 | 6988.398 | 7872.316 | 11657.998 | 8987.069 | 6395.752 | 8617.204 | 5946.288 | 6628.117 | 8087.211 | 6742.376 | 6404.819 | 8545.876 |
| 606 | 6173.542 | 8547.016 | 6986.579 | 7870.063 | 11657.998 | 8987.069 | 6395.752 | 8617.204 | 5944.413 | 6628.117 | 8087.211 | 6738.712 | 6401.951 | 8545.876 |
| 607 | 6173.542 | 8544.546 | 6984.763 | 7867.811 | 11657.998 | 8987.069 | 6395.752 | 8617.204 | 5942.543 | 6628.117 | 8087.211 | 6736.882 | 6399.088 | 8545.876 |
| 608 | 6173.542 | 8542.077 | 6982.948 | 7865.561 | 11657.998 | 8987.069 | 6395.752 | 8617.204 | 5940.676 | 6628.117 | 8087.211 | 6735.053 | 6396.231 | 8545.876 |
| 609 | 6173.542 | 8539.61 | 6981.136 | 7861.063 | 11657.998 | 8987.069 | 6395.752 | 8617.204 | 5938.813 | 6628.117 | 8087.211 | 6733.225 | 6393.378 | 8545.876 |
| 610 | 6173.542 | 8537.145 | 6979.326 | 7858.817 | 11657.998 | 8987.069 | 6395.752 | 8617.204 | 5936.953 | 6628.117 | 8087.211 | 6731.398 | 6390.53 | 8545.876 |
| 611 | 6173.542 | 8534.68 | 6977.517 | 7856.571 | 11657.998 | 8987.069 | 6395.752 | 8617.204 | 5935.096 | 6628.117 | 8087.211 | 6729.571 | 6387.687 | 8545.876 |
| 612 | 6173.542 | 8532.218 | 6975.711 | 7854.327 | 11657.998 | 8987.069 | 6395.752 | 8617.204 | 5933.244 | 6628.117 | 8087.211 | 6727.746 | 6384.848 | 8545.876 |
| 613 | 6173.542 | 8529.757 | 6973.907 | 7852.085 | 11657.998 | 8987.069 | 6395.752 | 8617.204 | 5931.394 | 6628.117 | 8087.211 | 6724.099 | 6382.014 | 8545.876 |
| 614 | 6173.542 | 8527.297 | 6972.105 | 7849.843 | 11657.998 | 8987.069 | 6395.752 | 8617.204 | 5929.549 | 6628.117 | 8087.211 | 6722.276 | 6379.186 | 8545.876 |
| 615 | 6173.542 | 8524.839 | 6970.305 | 7847.603 | 11657.998 | 8987.069 | 6395.752 | 8617.204 | 5927.706 | 6628.117 | 8087.211 | 6720.455 | 6376.362 | 8545.876 |
| 616 | 6173.542 | 8522.383 | 6968.507 | 7845.364 | 11657.998 | 8987.069 | 6395.752 | 8617.204 | 5925.868 | 6628.117 | 8087.211 | 6718.635 | 6373.542 | 8545.876 |
| 617 | 6173.542 | 8519.928 | 6966.711 | 7840.89 | 11657.998 | 8987.069 | 6395.752 | 8617.204 | 5924.032 | 6628.117 | 8087.211 | 6716.816 | 6370.728 | 8545.876 |
| 618 | 6173.542 | 8517.474 | 6964.917 | 7838.655 | 11657.998 | 8987.069 | 6395.752 | 8617.204 | 5922.2 | 6628.117 | 8087.211 | 6714.997 | 6367.918 | 8545.876 |
| 619 | 6173.542 | 8515.022 | 6963.126 | 7836.421 | 11657.998 | 8987.069 | 6395.752 | 8617.204 | 5920.372 | 6628.117 | 8087.211 | 6713.18 | 6365.113 | 8545.876 |
| 620 | 6173.542 | 8512.572 | 6961.336 | 7834.188 | 11657.998 | 8987.069 | 6395.752 | 8617.204 | 5918.547 | 6628.117 | 8087.211 | 6709.548 | 6362.312 | 8545.876 |
| 621 | 6173.542 | 8510.123 | 6959.548 | 7831.957 | 11657.998 | 8987.069 | 6395.752 | 8617.204 | 5916.725 | 6628.117 | 8087.211 | 6707.734 | 6359.516 | 8545.876 |
| 622 | 6173.542 | 8507.675 | 6957.763 | 7829.727 | 11657.998 | 8987.069 | 6395.752 | 8617.204 | 5914.907 | 6628.117 | 8087.211 | 6705.921 | 6356.725 | 8545.876 |
| 623 | 6173.542 | 8505.229 | 6955.979 | 7827.498 | 11657.998 | 8987.069 | 6395.752 | 8617.204 | 5913.092 | 6628.117 | 8087.211 | 6704.108 | 6353.939 | 8545.876 |
| 624 | 6173.542 | 8502.785 | 6954.198 | 7823.044 | 11657.998 | 8987.069 | 6395.752 | 8617.204 | 5911.281 | 6628.117 | 8087.211 | 6702.297 | 6351.157 | 8545.876 |
| 625 | 6173.542 | 8500.342 | 6952.418 | 7820.819 | 11657.998 | 8987.069 | 6395.752 | 8617.204 | 5909.473 | 6628.117 | 8087.211 | 6700.486 | 6348.38 | 8545.876 |
| 626 | 6173.542 | 8497.901 | 6950.641 | 7818.595 | 11657.998 | 8987.069 | 6395.752 | 8617.204 | 5907.668 | 6628.117 | 8087.211 | 6698.677 | 6345.607 | 8545.876 |
| 627 | 6173.542 | 8495.461 | 6948.866 | 7816.373 | 11657.998 | 8987.069 | 6395.752 | 8617.204 | 5905.866 | 6628.117 | 8087.211 | 6695.061 | 6342.839 | 8545.876 |
| 628 | 6173.542 | 8493.022 | 6947.092 | 7814.152 | 11657.998 | 8987.069 | 6395.752 | 8617.204 | 5904.068 | 6628.117 | 8087.211 | 6693.254 | 6340.075 | 8545.876 |
| 629 | 6173.542 | 8490.585 | 6945.321 | 7811.932 | 11657.998 | 8987.069 | 6395.752 | 8617.204 | 5902.274 | 6628.117 | 8087.211 | 6691.449 | 6337.316 | 8545.876 |
| 630 | 6173.542 | 8488.15 | 6943.552 | 7809.713 | 11657.998 | 8987.069 | 6395.752 | 8617.204 | 5900.482 | 6628.117 | 8087.211 | 6689.644 | 6334.562 | 8545.876 |
| 631 | 6173.542 | 8485.716 | 6941.785 | 7807.496 | 11657.998 | 8987.069 | 6395.752 | 8617.204 | 5898.694 | 6628.117 | 8087.211 | 6687.84 | 6331.812 | 8545.876 |
| 632 | 6173.542 | 8483.284 | 6940.019 | 7805.28 | 11657.998 | 8987.069 | 6395.752 | 8617.204 | 5896.909 | 6628.117 | 8087.211 | 6686.038 | 6329.066 | 8545.876 |
| 633 | 6173.542 | 8480.853 | 6938.256 | 7800.851 | 11657.998 | 8987.069 | 6395.752 | 8617.204 | 5895.127 | 6628.117 | 8087.211 | 6684.236 | 6326.325 | 8545.876 |
| 634 | 6173.542 | 8478.423 | 6936.495 | 7798.639 | 11657.998 | 8987.069 | 6395.752 | 8617.204 | 5893.349 | 6628.117 | 8087.211 | 6682.435 | 6323.589 | 8545.876 |
| 635 | 6173.542 | 8475.995 | 6934.736 | 7796.428 | 11657.998 | 8987.069 | 6395.752 | 8617.204 | 5891.574 | 6628.117 | 8087.211 | 6678.837 | 6320.857 | 8545.876 |
| 636 | 6173.542 | 8473.569 | 6932.979 | 7794.218 | 11657.998 | 8987.069 | 6395.752 | 8617.204 | 5889.802 | 6628.117 | 8087.211 | 6677.039 | 6318.129 | 8545.876 |
| 637 | 6173.542 | 8471.144 | 6931.224 | 7792.009 | 11657.998 | 8987.069 | 6395.752 | 8617.204 | 5888.033 | 6628.117 | 8087.211 | 6675.242 | 6315.406 | 8545.876 |
| 638 | 6173.542 | 8468.72 | 6929.471 | 7789.802 | 11657.998 | 8987.069 | 6395.752 | 8617.204 | 5886.267 | 6628.117 | 8087.211 | 6673.446 | 6312.687 | 8545.876 |
| 639 | 6173.542 | 8466.298 | 6927.72 | 7787.596 | 11657.998 | 8987.069 | 6395.752 | 8617.204 | 5884.505 | 6628.117 | 8087.211 | 6671.651 | 6309.973 | 8545.876 |
| 640 | 6173.542 | 8463.877 | 6925.971 | 7785.391 | 11657.998 | 8987.069 | 6395.752 | 8617.204 | 5882.746 | 6628.117 | 8087.211 | 6669.857 | 6307.263 | 8545.876 |
| 641 | 6173.542 | 8461.458 | 6924.224 | 7783.187 | 11657.998 | 8987.069 | 6395.752 | 8617.204 | 5880.99 | 6628.117 | 8087.211 | 6668.065 | 6304.557 | 8545.876 |
| 642 | 6173.542 | 8459.041 | 6922.479 | 7780.985 | 11657.998 | 8987.069 | 6395.752 | 8617.204 | 5879.237 | 6628.117 | 8087.211 | 6666.273 | 6301.855 | 8545.876 |
| 643 | 6173.542 | 8456.625 | 6920.736 | 7776.584 | 11657.998 | 8987.069 | 6395.752 | 8617.204 | 5877.487 | 6628.117 | 8087.211 | 6664.481 | 6299.158 | 8545.876 |
| 644 | 6173.542 | 8454.21 | 6918.995 | 7774.385 | 11657.998 | 8987.069 | 6395.752 | 8617.204 | 5875.741 | 6628.117 | 8087.211 | 6660.902 | 6296.466 | 8545.876 |
| 645 | 6173.542 | 8451.797 | 6917.255 | 7772.188 | 11657.998 | 8987.069 | 6395.752 | 8617.204 | 5873.997 | 6628.117 | 8087.211 | 6659.114 | 6293.777 | 8545.876 |
| 646 | 6173.542 | 8449.385 | 6915.518 | 7769.992 | 11657.998 | 8987.069 | 6395.752 | 8617.204 | 5872.257 | 6628.117 | 8087.211 | 6657.327 | 6291.093 | 8545.876 |
| 647 | 6173.542 | 8446.975 | 6913.783 | 7767.797 | 11657.998 | 8987.069 | 6395.752 | 8617.204 | 5870.52 | 6628.117 | 8087.211 | 6655.541 | 6288.413 | 8545.876 |
| 648 | 6173.542 | 8444.566 | 6912.05 | 7765.603 | 11657.998 | 8987.069 | 6395.752 | 8617.204 | 5868.785 | 6628.117 | 8087.211 | 6653.755 | 6285.738 | 8545.876 |
| 649 | 6173.542 | 8442.159 | 6910.319 | 7763.411 | 11657.998 | 8987.069 | 6395.752 | 8617.204 | 5867.054 | 6628.117 | 8087.211 | 6651.971 | 6283.067 | 8545.876 |
| 650 | 6173.542 | 8439.753 | 6908.59 | 7761.219 | 11657.998 | 8987.069 | 6395.752 | 8617.204 | 5867.054 | 6628.117 | 8087.211 | 6650.188 | 6280.399 | 8545.876 |
| 651 | 6173.542 | 8437.348 | 6906.863 | 7759.029 | 11657.998 | 8987.069 | 6395.752 | 8617.204 | 5867.054 | 6628.117 | 8087.211 | 6648.405 | 6277.737 | 8545.876 |
| 652 | 6173.542 | 8434.945 | 6905.138 | 7756.841 | 11657.998 | 8987.069 | 6395.752 | 8617.204 | 5867.054 | 6628.117 | 8087.211 | 6646.624 | 6275.078 | 8545.876 |
| 653 | 6173.542 | 8432.544 | 6903.415 | 7754.653 | 11657.998 | 8987.069 | 6395.752 | 8617.204 | 5867.054 | 6628.117 | 8087.211 | 6644.843 | 6272.423 | 8545.876 |
| 654 | 6173.542 | 8430.144 | 6901.694 | 7750.282 | 11657.998 | 8987.069 | 6395.752 | 8617.204 | 5867.054 | 6628.117 | 8087.211 | 6641.285 | 6269.773 | 8545.876 |
| 655 | 6173.542 | 8427.745 | 6899.974 | 7748.098 | 11657.998 | 8987.069 | 6395.752 | 8617.204 | 5867.054 | 6628.117 | 8087.211 | 6639.507 | 6267.127 | 8545.876 |
| 656 | 6173.542 | 8425.348 | 6898.257 | 7745.915 | 11657.998 | 8987.069 | 6395.752 | 8617.204 | 5867.054 | 6628.117 | 8087.211 | 6637.731 | 6264.485 | 8545.876 |
| 657 | 6173.542 | 8422.952 | 6896.542 | 7743.734 | 11657.998 | 8987.069 | 6395.752 | 8617.204 | 5867.054 | 6628.117 | 8087.211 | 6635.955 | 6261.847 | 8545.876 |
| 658 | 6173.542 | 8420.558 | 6894.828 | 7741.554 | 11657.998 | 8987.069 | 6395.752 | 8617.204 | 5867.054 | 6628.117 | 8087.211 | 6634.18 | 6259.214 | 8545.876 |
| 659 | 6173.542 | 8418.165 | 6893.117 | 7739.375 | 11657.998 | 8987.069 | 6395.752 | 8617.204 | 5867.054 | 6628.117 | 8087.211 | 6632.406 | 6256.584 | 8545.876 |
| 660 | 6173.542 | 8415.774 | 6891.408 | 7737.198 | 11657.998 | 8987.069 | 6395.752 | 8617.204 | 5867.054 | 6628.117 | 8087.211 | 6630.634 | 6253.958 | 8545.876 |
| 661 | 6173.542 | 8413.384 | 6889.7 | 7735.021 | 11657.998 | 8987.069 | 6395.752 | 8617.204 | 5867.054 | 6628.117 | 8087.211 | 6628.862 | 6251.337 | 8545.876 |
| 662 | 6173.542 | 8410.995 | 6887.995 | 7732.846 | 11657.998 | 8987.069 | 6395.752 | 8617.204 | 5867.054 | 6628.117 | 8087.211 | 6627.091 | 6248.72 | 8545.876 |
| 663 | 6173.542 | 8408.608 | 6886.291 | 7730.672 | 11657.998 | 8987.069 | 6395.752 | 8617.204 | 5867.054 | 6628.117 | 8087.211 | 6625.321 | 6246.106 | 8545.876 |
| 664 | 6173.542 | 8406.223 | 6884.59 | 7728.499 | 11657.998 | 8987.069 | 6395.752 | 8617.204 | 5867.054 | 6628.117 | 8087.211 | 6623.551 | 6243.497 | 8545.876 |
| 665 | 6173.542 | 8403.839 | 6882.89 | 7726.328 | 11657.998 | 8987.069 | 6395.752 | 8617.204 | 5867.054 | 6628.117 | 8087.211 | 6621.783 | 6240.892 | 8545.876 |
| 666 | 6173.542 | 8401.456 | 6881.193 | 7724.157 | 11657.998 | 8987.069 | 6395.752 | 8617.204 | 5867.054 | 6628.117 | 8087.211 | 6618.25 | 6238.291 | 8545.876 |
| 667 | 6173.542 | 8399.075 | 6879.497 | 7719.82 | 11657.998 | 8987.069 | 6395.752 | 8617.204 | 5867.054 | 6628.117 | 8087.211 | 6616.484 | 6235.694 | 8545.876 |
| 668 | 6173.542 | 8396.695 | 6877.803 | 7717.654 | 11657.998 | 8987.069 | 6395.752 | 8617.204 | 5867.054 | 6628.117 | 8087.211 | 6614.72 | 6233.1 | 8545.876 |
| 669 | 6173.542 | 8394.317 | 6876.111 | 7715.488 | 11657.998 | 8987.069 | 6395.752 | 8617.204 | 5867.054 | 6628.117 | 8087.211 | 6612.957 | 6230.511 | 8545.876 |
| 670 | 6173.542 | 8391.94 | 6874.421 | 7713.324 | 11657.998 | 8987.069 | 6395.752 | 8617.204 | 5867.054 | 6628.117 | 8087.211 | 6611.194 | 6227.926 | 8545.876 |
| 671 | 6173.542 | 8389.564 | 6872.733 | 7711.161 | 11657.998 | 8987.069 | 6395.752 | 8617.204 | 5867.054 | 6628.117 | 8087.211 | 6609.432 | 6225.345 | 8545.876 |
| 672 | 6173.542 | 8387.19 | 6871.047 | 7708.999 | 11657.998 | 8987.069 | 6395.752 | 8617.204 | 5867.054 | 6628.117 | 8087.211 | 6607.672 | 6222.767 | 8545.876 |
| 673 | 6173.542 | 8384.817 | 6869.363 | 7706.839 | 11657.998 | 8987.069 | 6395.752 | 8617.204 | 5867.054 | 6628.117 | 8087.211 | 6605.912 | 6220.194 | 8545.876 |
| 674 | 6173.542 | 8382.446 | 6867.681 | 7704.679 | 11657.998 | 8987.069 | 6395.752 | 8617.204 | 5867.054 | 6628.117 | 8087.211 | 6604.153 | 6217.624 | 8545.876 |
| 675 | 6173.542 | 8380.076 | 6866.001 | 7702.521 | 11657.998 | 8987.069 | 6395.752 | 8617.204 | 5867.054 | 6628.117 | 8087.211 | 6602.396 | 6215.059 | 8545.876 |
| 676 | 6173.542 | 8377.708 | 6864.323 | 7700.364 | 11657.998 | 8987.069 | 6395.752 | 8617.204 | 5867.054 | 6628.117 | 8087.211 | 6600.639 | 6212.497 | 8545.876 |
| 677 | 6173.542 | 8375.341 | 6862.646 | 7698.208 | 11657.998 | 8987.069 | 6395.752 | 8617.204 | 5867.054 | 6628.117 | 8087.211 | 6598.883 | 6209.939 | 8545.876 |
| 678 | 6173.542 | 8372.975 | 6860.972 | 7696.054 | 11657.998 | 8987.069 | 6395.752 | 8617.204 | 5867.054 | 6628.117 | 8087.211 | 6597.128 | 6207.385 | 8545.876 |
| 679 | 6173.542 | 8370.611 | 6859.299 | 7693.9 | 11657.998 | 8987.069 | 6395.752 | 8617.204 | 5867.054 | 6628.117 | 8087.211 | 6595.374 | 6204.835 | 8545.876 |
| 680 | 6173.542 | 8368.248 | 6857.629 | 7691.748 | 11657.998 | 8987.069 | 6395.752 | 8617.204 | 5867.054 | 6628.117 | 8087.211 | 6591.868 | 6202.289 | 8545.876 |
| 681 | 6173.542 | 8365.887 | 6855.96 | 7689.597 | 11657.998 | 8987.069 | 6395.752 | 8617.204 | 5867.054 | 6628.117 | 8087.211 | 6590.117 | 6199.746 | 8545.876 |
| 682 | 6173.542 | 8363.527 | 6854.293 | 7687.448 | 11657.998 | 8987.069 | 6395.752 | 8617.204 | 5867.054 | 6628.117 | 8087.211 | 6588.367 | 6197.208 | 8545.876 |
| 683 | 6173.542 | 8361.168 | 6852.628 | 7685.299 | 11657.998 | 8987.069 | 6395.752 | 8617.204 | 5867.054 | 6628.117 | 8087.211 | 6586.617 | 6194.673 | 8545.876 |
| 684 | 6173.542 | 8358.811 | 6850.965 | 7683.152 | 11657.998 | 8987.069 | 6395.752 | 8617.204 | 5867.054 | 6628.117 | 8087.211 | 6584.869 | 6192.142 | 8545.876 |
| 685 | 6173.542 | 8356.456 | 6849.304 | 7678.861 | 11657.998 | 8987.069 | 6395.752 | 8617.204 | 5867.054 | 6628.117 | 8087.211 | 6583.121 | 6189.615 | 8545.876 |
| 686 | 6173.542 | 8354.101 | 6847.645 | 7676.717 | 11657.998 | 8987.069 | 6395.752 | 8617.204 | 5867.054 | 6628.117 | 8087.211 | 6581.374 | 6187.091 | 8545.876 |
| 687 | 6173.542 | 8351.748 | 6845.988 | 7674.574 | 11657.998 | 8987.069 | 6395.752 | 8617.204 | 5867.054 | 6628.117 | 8087.211 | 6579.629 | 6184.572 | 8545.876 |
| 688 | 6173.542 | 8349.397 | 6844.332 | 7672.433 | 11657.998 | 8987.069 | 6395.752 | 8617.204 | 5867.054 | 6628.117 | 8087.211 | 6577.884 | 6182.056 | 8545.876 |
| 689 | 6173.542 | 8347.047 | 6842.679 | 7670.293 | 11657.998 | 8987.069 | 6395.752 | 8617.204 | 5867.054 | 6628.117 | 8087.211 | 6576.14 | 6179.544 | 8545.876 |
| 690 | 6173.542 | 8344.698 | 6841.027 | 7668.154 | 11657.998 | 8987.069 | 6395.752 | 8617.204 | 5867.054 | 6628.117 | 8087.211 | 6574.397 | 6177.035 | 8545.876 |
| 691 | 6173.542 | 8342.351 | 6839.378 | 7666.016 | 11657.998 | 8987.069 | 6395.752 | 8617.204 | 5867.054 | 6628.117 | 8087.211 | 6572.655 | 6174.53 | 8545.876 |
| 692 | 6173.542 | 8340.005 | 6837.73 | 7663.88 | 11657.998 | 8987.069 | 6395.752 | 8617.204 | 5867.054 | 6628.117 | 8087.211 | 6570.914 | 6172.029 | 8545.876 |
| 693 | 6173.542 | 8337.661 | 6836.084 | 7661.744 | 11657.998 | 8987.069 | 6395.752 | 8617.204 | 5867.054 | 6628.117 | 8087.211 | 6569.174 | 6169.532 | 8545.876 |
| 694 | 6173.542 | 8335.318 | 6834.44 | 7659.61 | 11657.998 | 8987.069 | 6395.752 | 8617.204 | 5867.054 | 6628.117 | 8087.211 | 6567.434 | 6167.038 | 8545.876 |
| 695 | 6173.542 | 8332.976 | 6832.798 | 7657.477 | 11657.998 | 8987.069 | 6395.752 | 8617.204 | 5867.054 | 6628.117 | 8087.211 | 6565.696 | 6164.548 | 8545.876 |
| 696 | 6173.542 | 8330.636 | 6831.158 | 7655.345 | 11657.998 | 8987.069 | 6395.752 | 8617.204 | 5867.054 | 6628.117 | 8087.211 | 6563.959 | 6162.062 | 8545.876 |
| 697 | 6173.542 | 8328.297 | 6829.519 | 7653.215 | 11657.998 | 8987.069 | 6395.752 | 8617.204 | 5867.054 | 6628.117 | 8087.211 | 6562.222 | 6159.579 | 8545.876 |
| 698 | 6173.542 | 8325.959 | 6827.883 | 7651.085 | 11657.998 | 8987.069 | 6395.752 | 8617.204 | 5867.054 | 6628.117 | 8087.211 | 6560.487 | 6157.1 | 8545.876 |
| 699 | 6173.542 | 8323.623 | 6826.248 | 7648.957 | 11657.998 | 8987.069 | 6395.752 | 8617.204 | 5867.054 | 6628.117 | 8087.211 | 6558.752 | 6154.625 | 8545.876 |
| 700 | 6173.542 | 8321.288 | 6824.615 | 7646.83 | 11657.998 | 8987.069 | 6395.752 | 8617.204 | 5867.054 | 6628.117 | 8087.211 | 6557.018 | 6152.153 | 8545.876 |
| 701 | 6173.542 | 8318.955 | 6822.984 | 7644.704 | 11657.998 | 8987.069 | 6395.752 | 8617.204 | 5867.054 | 6628.117 | 8087.211 | 6553.554 | 6149.685 | 8545.876 |
| 702 | 6173.542 | 8316.623 | 6821.355 | 7642.579 | 11657.998 | 8987.069 | 6395.752 | 8617.204 | 5867.054 | 6628.117 | 8087.211 | 6551.823 | 6147.22 | 8545.876 |
| 703 | 6173.542 | 8314.292 | 6819.728 | 7640.456 | 11657.998 | 8987.069 | 6395.752 | 8617.204 | 5867.054 | 6628.117 | 8087.211 | 6550.092 | 6144.759 | 8545.876 |
| 704 | 6173.542 | 8311.963 | 6818.103 | 7638.333 | 11657.998 | 8987.069 | 6395.752 | 8617.204 | 5867.054 | 6628.117 | 8087.211 | 6548.363 | 6142.302 | 8545.876 |
| 705 | 6173.542 | 8309.635 | 6816.48 | 7636.212 | 11657.998 | 8987.069 | 6395.752 | 8617.204 | 5867.054 | 6628.117 | 8087.211 | 6546.635 | 6139.848 | 8545.876 |
| 706 | 6173.542 | 8307.309 | 6814.858 | 7634.092 | 11657.998 | 8987.069 | 6395.752 | 8617.204 | 5867.054 | 6628.117 | 8087.211 | 6544.908 | 6137.397 | 8545.876 |
| 707 | 6173.542 | 8304.984 | 6813.238 | 7631.973 | 11657.998 | 8987.069 | 6395.752 | 8617.204 | 5867.054 | 6628.117 | 8087.211 | 6543.181 | 6134.951 | 8545.876 |
| 708 | 6173.542 | 8302.66 | 6811.621 | 7629.856 | 11657.998 | 8987.069 | 6395.752 | 8617.204 | 5867.054 | 6628.117 | 8087.211 | 6541.456 | 6132.507 | 8545.876 |
| 709 | 6173.542 | 8300.338 | 6810.005 | 7627.739 | 11657.998 | 8987.069 | 6395.752 | 8617.204 | 5867.054 | 6628.117 | 8087.211 | 6539.731 | 6130.067 | 8545.876 |
| 710 | 6173.542 | 8298.017 | 6808.39 | 7625.624 | 11657.998 | 8987.069 | 6395.752 | 8617.204 | 5867.054 | 6628.117 | 8087.211 | 6538.007 | 6127.631 | 8545.876 |
| 711 | 6173.542 | 8295.697 | 6806.778 | 7623.51 | 11657.998 | 8987.069 | 6395.752 | 8617.204 | 5867.054 | 6628.117 | 8087.211 | 6536.285 | 6125.198 | 8545.876 |
| 712 | 6173.542 | 8293.379 | 6805.168 | 7621.397 | 11657.998 | 8987.069 | 6395.752 | 8617.204 | 5867.054 | 6628.117 | 8087.211 | 6534.563 | 6122.769 | 8545.876 |
| 713 | 6173.542 | 8291.062 | 6803.559 | 7619.285 | 11657.998 | 8987.069 | 6395.752 | 8617.204 | 5867.054 | 6628.117 | 8087.211 | 6532.842 | 6120.343 | 8545.876 |
| 714 | 6173.542 | 8288.746 | 6801.952 | 7617.175 | 11657.998 | 8987.069 | 6395.752 | 8617.204 | 5867.054 | 6628.117 | 8087.211 | 6531.122 | 6117.921 | 8545.876 |
| 715 | 6173.542 | 8286.432 | 6800.348 | 7615.065 | 11657.998 | 8987.069 | 6395.752 | 8617.204 | 5867.054 | 6628.117 | 8087.211 | 6529.402 | 6115.502 | 8545.876 |
| 716 | 6173.542 | 8284.12 | 6798.744 | 7612.957 | 11657.998 | 8987.069 | 6395.752 | 8617.204 | 5867.054 | 6628.117 | 8087.211 | 6527.684 | 6113.087 | 8545.876 |
| 717 | 6173.542 | 8281.808 | 6797.143 | 7610.85 | 11657.998 | 8987.069 | 6395.752 | 8617.204 | 5867.054 | 6628.117 | 8087.211 | 6525.967 | 6110.675 | 8545.876 |
| 718 | 6173.542 | 8279.498 | 6795.544 | 7608.744 | 11657.998 | 8987.069 | 6395.752 | 8617.204 | 5867.054 | 6628.117 | 8087.211 | 6524.25 | 6108.266 | 8545.876 |
| 719 | 6173.542 | 8277.189 | 6793.946 | 7606.639 | 11657.998 | 8987.069 | 6395.752 | 8617.204 | 5867.054 | 6628.117 | 8087.211 | 6522.535 | 6105.861 | 8545.876 |
| 720 | 6173.542 | 8274.882 | 6792.351 | 7604.535 | 11657.998 | 8987.069 | 6395.752 | 8617.204 | 5867.054 | 6628.117 | 8087.211 | 6520.82 | 6103.459 | 8545.876 |
| 721 | 6173.542 | 8272.576 | 6790.757 | 7602.433 | 11657.998 | 8987.069 | 6395.752 | 8617.204 | 5867.054 | 6628.117 | 8087.211 | 6519.106 | 6101.061 | 8545.876 |
| 722 | 6173.542 | 8270.271 | 6789.165 | 7600.332 | 11657.998 | 8987.069 | 6395.752 | 8617.204 | 5867.054 | 6628.117 | 8087.211 | 6517.394 | 6098.666 | 8545.876 |
| 723 | 6173.542 | 8267.968 | 6787.574 | 7598.232 | 11657.998 | 8987.069 | 6395.752 | 8617.204 | 5867.054 | 6628.117 | 8087.211 | 6515.682 | 6096.274 | 8545.876 |
| 724 | 6173.542 | 8265.666 | 6785.986 | 7596.133 | 11657.998 | 8987.069 | 6395.752 | 8617.204 | 5867.054 | 6628.117 | 8087.211 | 6513.971 | 6093.886 | 8545.876 |
| 725 | 6173.542 | 8263.366 | 6784.399 | 7594.035 | 11657.998 | 8987.069 | 6395.752 | 8617.204 | 5867.054 | 6628.117 | 8087.211 | 6512.26 | 6091.501 | 8545.876 |
| 726 | 6173.542 | 8261.067 | 6782.815 | 7591.938 | 11657.998 | 8987.069 | 6395.752 | 8617.204 | 5867.054 | 6628.117 | 8087.211 | 6510.551 | 6089.12 | 8545.876 |
| 727 | 6173.542 | 8258.769 | 6781.232 | 7589.843 | 11657.998 | 8987.069 | 6395.752 | 8617.204 | 5867.054 | 6628.117 | 8087.211 | 6508.843 | 6086.741 | 8545.876 |
| 728 | 6173.542 | 8256.472 | 6779.65 | 7587.748 | 11657.998 | 8987.069 | 6395.752 | 8617.204 | 5867.054 | 6628.117 | 8087.211 | 6507.135 | 6084.366 | 8545.876 |
| 729 | 6173.542 | 8254.177 | 6778.071 | 7585.655 | 11657.998 | 8987.069 | 6395.752 | 8617.204 | 5867.054 | 6628.117 | 8087.211 | 6505.429 | 6081.995 | 8545.876 |
| 730 | 6173.542 | 8251.883 | 6776.494 | 7583.563 | 11657.998 | 8987.069 | 6395.752 | 8617.204 | 5867.054 | 6628.117 | 8087.211 | 6503.723 | 6079.627 | 8545.876 |
| 731 | 6173.542 | 8249.591 | 6774.918 | 7581.472 | 11657.998 | 8987.069 | 6395.752 | 8617.204 | 5867.054 | 6628.117 | 8087.211 | 6502.018 | 6077.262 | 8545.876 |
| 732 | 6173.542 | 8247.3 | 6773.344 | 7579.383 | 11657.998 | 8987.069 | 6395.752 | 8617.204 | 5867.054 | 6628.117 | 8087.211 | 6500.314 | 6074.9 | 8545.876 |
| 733 | 6173.542 | 8245.01 | 6771.772 | 7577.294 | 11657.998 | 8987.069 | 6395.752 | 8617.204 | 5867.054 | 6628.117 | 8087.211 | 6498.611 | 6072.542 | 8545.876 |
| 734 | 6173.542 | 8242.721 | 6770.202 | 7575.207 | 11657.998 | 8987.069 | 6395.752 | 8617.204 | 5867.054 | 6628.117 | 8087.211 | 6496.909 | 6070.187 | 8545.876 |
| 735 | 6173.542 | 8240.434 | 6768.633 | 7573.12 | 11657.998 | 8987.069 | 6395.752 | 8617.204 | 5867.054 | 6628.117 | 8087.211 | 6495.208 | 6067.835 | 8545.876 |
| 736 | 6173.542 | 8238.148 | 6767.066 | 7571.035 | 11657.998 | 8987.069 | 6395.752 | 8617.204 | 5867.054 | 6628.117 | 8087.211 | 6493.508 | 6065.486 | 8545.876 |
| 737 | 6173.542 | 8235.864 | 6765.502 | 7568.951 | 11657.998 | 8987.069 | 6395.752 | 8617.204 | 5867.054 | 6628.117 | 8087.211 | 6491.808 | 6063.141 | 8545.876 |
| 738 | 6173.542 | 8233.581 | 6763.938 | 7566.868 | 11657.998 | 8987.069 | 6395.752 | 8617.204 | 5867.054 | 6628.117 | 8087.211 | 6490.11 | 6060.799 | 8545.876 |
| 739 | 6173.542 | 8231.299 | 6762.377 | 7564.787 | 11657.998 | 8987.069 | 6395.752 | 8617.204 | 5867.054 | 6628.117 | 8087.211 | 6488.412 | 6058.46 | 8545.876 |
| 740 | 6173.542 | 8229.018 | 6760.818 | 7562.706 | 11657.998 | 8987.069 | 6395.752 | 8617.204 | 5867.054 | 6628.117 | 8087.211 | 6486.715 | 6056.124 | 8545.876 |
| 741 | 6173.542 | 8226.739 | 6759.26 | 7560.627 | 11657.998 | 8987.069 | 6395.752 | 8617.204 | 5867.054 | 6628.117 | 8087.211 | 6485.02 | 6053.791 | 8545.876 |
| 742 | 6173.542 | 8224.462 | 6757.704 | 7558.549 | 11657.998 | 8987.069 | 6395.752 | 8617.204 | 5867.054 | 6628.117 | 8087.211 | 6483.325 | 6051.462 | 8545.876 |
| 743 | 6173.542 | 8222.185 | 6756.15 | 7556.472 | 11657.998 | 8987.069 | 6395.752 | 8617.204 | 5867.054 | 6628.117 | 8087.211 | 6481.631 | 6049.136 | 8545.876 |
| 744 | 6173.542 | 8219.91 | 6754.597 | 7554.396 | 11657.998 | 8987.069 | 6395.752 | 8617.204 | 5867.054 | 6628.117 | 8087.211 | 6479.937 | 6046.813 | 8545.876 |
| 745 | 6173.542 | 8217.636 | 6753.047 | 7552.321 | 11657.998 | 8987.069 | 6395.752 | 8617.204 | 5867.054 | 6628.117 | 8087.211 | 6478.245 | 6044.493 | 8545.876 |
| 746 | 6173.542 | 8215.364 | 6751.498 | 7550.247 | 11657.998 | 8987.069 | 6395.752 | 8617.204 | 5867.054 | 6628.117 | 8087.211 | 6476.554 | 6042.177 | 8545.876 |
| 747 | 6173.542 | 8213.092 | 6749.951 | 7548.175 | 11657.998 | 8987.069 | 6395.752 | 8617.204 | 5867.054 | 6628.117 | 8087.211 | 6474.863 | 6039.863 | 8545.876 |
| 748 | 6173.542 | 8210.823 | 6748.406 | 7546.103 | 11657.998 | 8987.069 | 6395.752 | 8617.204 | 5867.054 | 6628.117 | 8087.211 | 6473.173 | 6037.553 | 8545.876 |
| 749 | 6173.542 | 8208.554 | 6746.862 | 7544.033 | 11657.998 | 8987.069 | 6395.752 | 8617.204 | 5867.054 | 6628.117 | 8087.211 | 6471.484 | 6035.246 | 8545.876 |
| 750 | 6173.542 | 8206.287 | 6745.32 | 7541.964 | 11657.998 | 8987.069 | 6395.752 | 8617.204 | 5867.054 | 6628.117 | 8087.211 | 6469.797 | 6032.942 | 8545.876 |
| 751 | 6173.542 | 8204.021 | 6743.781 | 7539.896 | 11657.998 | 8987.069 | 6395.752 | 8617.204 | 5867.054 | 6628.117 | 8087.211 | 6468.11 | 6030.641 | 8545.876 |
| 752 | 6173.542 | 8201.756 | 6742.242 | 7537.829 | 11657.998 | 8987.069 | 6395.752 | 8617.204 | 5867.054 | 6628.117 | 8087.211 | 6466.423 | 6028.343 | 8545.876 |
| 753 | 6173.542 | 8199.493 | 6740.706 | 7535.763 | 11657.998 | 8987.069 | 6395.752 | 8617.204 | 5867.054 | 6628.117 | 8087.211 | 6464.738 | 6026.048 | 8545.876 |
| 754 | 6173.542 | 8197.231 | 6739.171 | 7533.699 | 11657.998 | 8987.069 | 6395.752 | 8617.204 | 5867.054 | 6628.117 | 8087.211 | 6463.054 | 6023.756 | 8545.876 |
| 755 | 6173.542 | 8194.97 | 6737.638 | 7531.635 | 11657.998 | 8987.069 | 6395.752 | 8617.204 | 5867.054 | 6628.117 | 8087.211 | 6461.37 | 6021.468 | 8545.876 |
| 756 | 6173.542 | 8192.711 | 6736.107 | 7529.573 | 11657.998 | 8987.069 | 6395.752 | 8617.204 | 5867.054 | 6628.117 | 8087.211 | 6459.688 | 6019.182 | 8545.876 |
| 757 | 6173.542 | 8190.453 | 6734.578 | 7527.512 | 11657.998 | 8987.069 | 6395.752 | 8617.204 | 5867.054 | 6628.117 | 8087.211 | 6458.006 | 6016.9 | 8545.876 |
| 758 | 6173.542 | 8188.196 | 6733.05 | 7525.452 | 11657.998 | 8987.069 | 6395.752 | 8617.204 | 5867.054 | 6628.117 | 8087.211 | 6456.325 | 6014.621 | 8545.876 |
| 759 | 6173.542 | 8185.941 | 6731.524 | 7523.393 | 11657.998 | 8987.069 | 6395.752 | 8617.204 | 5867.054 | 6628.117 | 8087.211 | 6454.645 | 6012.344 | 8545.876 |
| 760 | 6173.542 | 8183.687 | 6730 | 7521.335 | 11657.998 | 8987.069 | 6395.752 | 8617.204 | 5867.054 | 6628.117 | 8087.211 | 6452.966 | 6010.071 | 8545.876 |
| 761 | 6173.542 | 8181.434 | 6728.478 | 7519.278 | 11657.998 | 8987.069 | 6395.752 | 8617.204 | 5867.054 | 6628.117 | 8087.211 | 6451.287 | 6007.801 | 8545.876 |
| 762 | 6173.542 | 8179.182 | 6726.957 | 7517.223 | 11657.998 | 8987.069 | 6395.752 | 8617.204 | 5867.054 | 6628.117 | 8087.211 | 6449.61 | 6005.533 | 8545.876 |
| 763 | 6173.542 | 8176.932 | 6725.438 | 7515.168 | 11657.998 | 8987.069 | 6395.752 | 8617.204 | 5867.054 | 6628.117 | 8087.211 | 6447.933 | 6003.269 | 8545.876 |
| 764 | 6173.542 | 8174.683 | 6723.921 | 7513.115 | 11657.998 | 8987.069 | 6395.752 | 8617.204 | 5867.054 | 6628.117 | 8087.211 | 6446.258 | 6001.008 | 8545.876 |
| 765 | 6173.542 | 8172.435 | 6722.406 | 7511.063 | 11657.998 | 8987.069 | 6395.752 | 8617.204 | 5867.054 | 6628.117 | 8087.211 | 6444.583 | 5998.75 | 8545.876 |
| 766 | 6173.542 | 8170.189 | 6720.892 | 7509.011 | 11657.998 | 8987.069 | 6395.752 | 8617.204 | 5867.054 | 6628.117 | 8087.211 | 6442.909 | 5996.494 | 8545.876 |
| 767 | 6173.542 | 8167.944 | 6719.38 | 7506.962 | 11657.998 | 8987.069 | 6395.752 | 8617.204 | 5867.054 | 6628.117 | 8087.211 | 6441.236 | 5994.242 | 8545.876 |
| 768 | 6173.542 | 8165.7 | 6717.87 | 7506.962 | 11657.998 | 8987.069 | 6395.752 | 8617.204 | 5867.054 | 6628.117 | 8087.211 | 6439.564 | 5991.993 | 8545.876 |
| 769 | 6173.542 | 8163.458 | 6716.362 | 7504.913 | 11657.998 | 8987.069 | 6395.752 | 8617.204 | 5867.054 | 6628.117 | 8087.211 | 6437.893 | 5989.747 | 8545.876 |
| 770 | 6173.542 | 8161.217 | 6714.855 | 7502.865 | 11657.998 | 8987.069 | 6395.752 | 8617.204 | 5867.054 | 6628.117 | 8087.211 | 6436.222 | 5987.503 | 8545.876 |
| 771 | 6173.542 | 8158.977 | 6713.35 | 7500.818 | 11657.998 | 8987.069 | 6395.752 | 8617.204 | 5867.054 | 6628.117 | 8087.211 | 6434.553 | 5985.263 | 8545.876 |
| 772 | 6173.542 | 8156.738 | 6711.847 | 7498.773 | 11657.998 | 8987.069 | 6395.752 | 8617.204 | 5867.054 | 6628.117 | 8087.211 | 6434.553 | 5983.025 | 8545.876 |
| 773 | 6173.542 | 8154.501 | 6710.346 | 7496.728 | 11657.998 | 8987.069 | 6395.752 | 8617.204 | 5867.054 | 6628.117 | 8087.211 | 6432.884 | 5980.791 | 8545.876 |
| 774 | 6173.542 | 8152.265 | 6708.846 | 7494.685 | 11657.998 | 8987.069 | 6395.752 | 8617.204 | 5867.054 | 6628.117 | 8087.211 | 6431.216 | 5978.559 | 8545.876 |
| 775 | 6173.542 | 8150.03 | 6707.348 | 7492.643 | 11657.998 | 8987.069 | 6395.752 | 8617.204 | 5867.054 | 6628.117 | 8087.211 | 6429.549 | 5976.33 | 8545.876 |
| 776 | 6173.542 | 8147.797 | 6705.851 | 7490.602 | 11657.998 | 8987.069 | 6395.752 | 8617.204 | 5867.054 | 6628.117 | 8087.211 | 6427.883 | 5974.105 | 8545.876 |
| 777 | 6173.542 | 8145.565 | 6704.357 | 7488.562 | 11657.998 | 8987.069 | 6395.752 | 8617.204 | 5867.054 | 6628.117 | 8087.211 | 6426.218 | 5971.882 | 8545.876 |
| 778 | 6173.542 | 8143.334 | 6702.864 | 7486.523 | 11657.998 | 8987.069 | 6395.752 | 8617.204 | 5867.054 | 6628.117 | 8087.211 | 6424.553 | 5969.662 | 8545.876 |
| 779 | 6173.542 | 8141.104 | 6701.373 | 7484.486 | 11657.998 | 8987.069 | 6395.752 | 8617.204 | 5867.054 | 6628.117 | 8087.211 | 6422.89 | 5967.444 | 8545.876 |
| 780 | 6173.542 | 8138.876 | 6699.883 | 7482.449 | 11657.998 | 8987.069 | 6395.752 | 8617.204 | 5867.054 | 6628.117 | 8087.211 | 6421.227 | 5965.23 | 8545.876 |
| 781 | 6173.542 | 8136.649 | 6698.395 | 7480.413 | 11657.998 | 8987.069 | 6395.752 | 8617.204 | 5867.054 | 6628.117 | 8087.211 | 6419.565 | 5963.019 | 8545.876 |
| 782 | 6173.542 | 8134.423 | 6696.909 | 7478.379 | 11657.998 | 8987.069 | 6395.752 | 8617.204 | 5867.054 | 6628.117 | 8087.211 | 6417.904 | 5960.81 | 8545.876 |
| 783 | 6173.542 | 8132.198 | 6695.425 | 7476.346 | 11657.998 | 8987.069 | 6395.752 | 8617.204 | 5867.054 | 6628.117 | 8087.211 | 6416.244 | 5958.605 | 8545.876 |
| 784 | 6173.542 | 8129.975 | 6693.942 | 7474.314 | 11657.998 | 8987.069 | 6395.752 | 8617.204 | 5867.054 | 6628.117 | 8087.211 | 6414.585 | 5956.402 | 8545.876 |
| 785 | 6173.542 | 8127.753 | 6692.462 | 7472.283 | 11657.998 | 8987.069 | 6395.752 | 8617.204 | 5867.054 | 6628.117 | 8087.211 | 6412.927 | 5954.202 | 8545.876 |
| 786 | 6173.542 | 8125.533 | 6690.982 | 7470.253 | 11657.998 | 8987.069 | 6395.752 | 8617.204 | 5867.054 | 6628.117 | 8087.211 | 6411.269 | 5952.005 | 8545.876 |
| 787 | 6173.542 | 8123.313 | 6689.505 | 7468.224 | 11657.998 | 8987.069 | 6395.752 | 8617.204 | 5867.054 | 6628.117 | 8087.211 | 6409.612 | 5949.81 | 8545.876 |
| 788 | 6173.542 | 8121.095 | 6688.029 | 7468.224 | 11657.998 | 8987.069 | 6395.752 | 8617.204 | 5867.054 | 6628.117 | 8087.211 | 6407.957 | 5947.619 | 8545.876 |
| 789 | 6173.542 | 8118.878 | 6686.555 | 7466.196 | 11657.998 | 8987.069 | 6395.752 | 8617.204 | 5867.054 | 6628.117 | 8087.211 | 6406.302 | 5945.43 | 8545.876 |
| 790 | 6173.542 | 8116.663 | 6685.083 | 7464.169 | 11657.998 | 8987.069 | 6395.752 | 8617.204 | 5867.054 | 6628.117 | 8087.211 | 6404.648 | 5943.244 | 8545.876 |
| 791 | 6173.542 | 8114.448 | 6683.612 | 7462.144 | 11657.998 | 8987.069 | 6395.752 | 8617.204 | 5867.054 | 6628.117 | 8087.211 | 6402.994 | 5941.061 | 8545.876 |
| 792 | 6173.542 | 8112.235 | 6682.143 | 7460.119 | 11657.998 | 8987.069 | 6395.752 | 8617.204 | 5867.054 | 6628.117 | 8087.211 | 6401.342 | 5938.881 | 8545.876 |
| 793 | 6173.542 | 8110.023 | 6680.675 | 7458.096 | 11657.998 | 8987.069 | 6395.752 | 8617.204 | 5867.054 | 6628.117 | 8087.211 | 6399.69 | 5936.703 | 8545.876 |
| 794 | 6173.542 | 8107.813 | 6679.21 | 7456.074 | 11657.998 | 8987.069 | 6395.752 | 8617.204 | 5867.054 | 6628.117 | 8087.211 | 6399.69 | 5934.528 | 8545.876 |
| 795 | 6173.542 | 8105.604 | 6677.746 | 7454.053 | 11657.998 | 8987.069 | 6395.752 | 8617.204 | 5867.054 | 6628.117 | 8087.211 | 6398.04 | 5932.356 | 8545.876 |
| 796 | 6173.542 | 8103.395 | 6676.284 | 7452.033 | 11657.998 | 8987.069 | 6395.752 | 8617.204 | 5867.054 | 6628.117 | 8087.211 | 6396.39 | 5930.187 | 8545.876 |
| 797 | 6173.542 | 8101.189 | 6674.823 | 7450.014 | 11657.998 | 8987.069 | 6395.752 | 8617.204 | 5867.054 | 6628.117 | 8087.211 | 6394.741 | 5928.021 | 8545.876 |
| 798 | 6173.542 | 8098.983 | 6673.364 | 7447.996 | 11657.998 | 8987.069 | 6395.752 | 8617.204 | 5867.054 | 6628.117 | 8087.211 | 6393.093 | 5925.857 | 8545.876 |
| 799 | 6173.542 | 8096.779 | 6671.907 | 7445.979 | 11657.998 | 8987.069 | 6395.752 | 8617.204 | 5867.054 | 6628.117 | 8087.211 | 6391.446 | 5923.696 | 8545.876 |